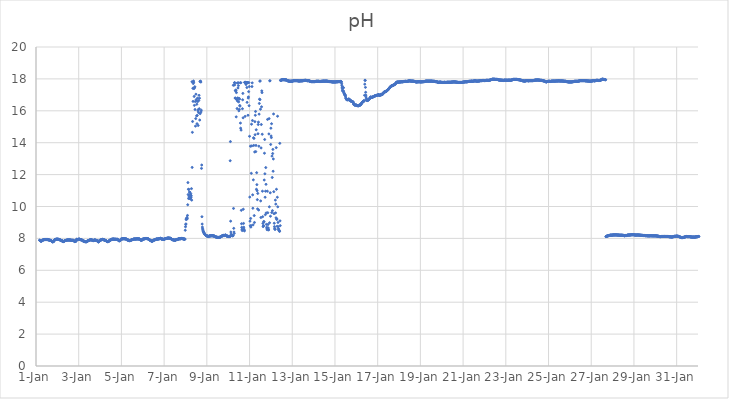
| Category | pH |
|---|---|
| 44562.166666666664 | 7.89 |
| 44562.177083333336 | 7.88 |
| 44562.1875 | 7.87 |
| 44562.197916666664 | 7.86 |
| 44562.208333333336 | 7.85 |
| 44562.21875 | 7.83 |
| 44562.229166666664 | 7.83 |
| 44562.239583333336 | 7.82 |
| 44562.25 | 7.83 |
| 44562.260416666664 | 7.84 |
| 44562.270833333336 | 7.84 |
| 44562.28125 | 7.86 |
| 44562.291666666664 | 7.87 |
| 44562.302083333336 | 7.88 |
| 44562.3125 | 7.89 |
| 44562.322916666664 | 7.9 |
| 44562.333333333336 | 7.91 |
| 44562.34375 | 7.91 |
| 44562.354166666664 | 7.91 |
| 44562.364583333336 | 7.91 |
| 44562.375 | 7.92 |
| 44562.385416666664 | 7.92 |
| 44562.395833333336 | 7.93 |
| 44562.40625 | 7.93 |
| 44562.416666666664 | 7.93 |
| 44562.427083333336 | 7.93 |
| 44562.4375 | 7.93 |
| 44562.447916666664 | 7.93 |
| 44562.458333333336 | 7.93 |
| 44562.46875 | 7.93 |
| 44562.479166666664 | 7.93 |
| 44562.489583333336 | 7.93 |
| 44562.5 | 7.93 |
| 44562.510416666664 | 7.93 |
| 44562.520833333336 | 7.93 |
| 44562.53125 | 7.93 |
| 44562.541666666664 | 7.92 |
| 44562.552083333336 | 7.93 |
| 44562.5625 | 7.92 |
| 44562.572916666664 | 7.92 |
| 44562.583333333336 | 7.91 |
| 44562.59375 | 7.91 |
| 44562.604166666664 | 7.9 |
| 44562.614583333336 | 7.9 |
| 44562.625 | 7.89 |
| 44562.635416666664 | 7.89 |
| 44562.645833333336 | 7.89 |
| 44562.65625 | 7.87 |
| 44562.666666666664 | 7.88 |
| 44562.677083333336 | 7.88 |
| 44562.6875 | 7.87 |
| 44562.697916666664 | 7.87 |
| 44562.708333333336 | 7.86 |
| 44562.71875 | 7.85 |
| 44562.729166666664 | 7.85 |
| 44562.739583333336 | 7.83 |
| 44562.75 | 7.81 |
| 44562.760416666664 | 7.79 |
| 44562.770833333336 | 7.79 |
| 44562.78125 | 7.78 |
| 44562.791666666664 | 7.79 |
| 44562.802083333336 | 7.8 |
| 44562.8125 | 7.8 |
| 44562.822916666664 | 7.8 |
| 44562.833333333336 | 7.82 |
| 44562.84375 | 7.84 |
| 44562.854166666664 | 7.87 |
| 44562.864583333336 | 7.9 |
| 44562.875 | 7.91 |
| 44562.885416666664 | 7.92 |
| 44562.895833333336 | 7.93 |
| 44562.90625 | 7.93 |
| 44562.916666666664 | 7.94 |
| 44562.927083333336 | 7.94 |
| 44562.9375 | 7.94 |
| 44562.947916666664 | 7.95 |
| 44562.958333333336 | 7.95 |
| 44562.96875 | 7.95 |
| 44562.979166666664 | 7.95 |
| 44562.989583333336 | 7.95 |
| 44563.0 | 7.95 |
| 44563.010416666664 | 7.95 |
| 44563.020833333336 | 7.95 |
| 44563.03125 | 7.95 |
| 44563.041666666664 | 7.94 |
| 44563.052083333336 | 7.94 |
| 44563.0625 | 7.94 |
| 44563.072916666664 | 7.93 |
| 44563.083333333336 | 7.93 |
| 44563.09375 | 7.93 |
| 44563.104166666664 | 7.92 |
| 44563.114583333336 | 7.91 |
| 44563.125 | 7.9 |
| 44563.135416666664 | 7.9 |
| 44563.145833333336 | 7.89 |
| 44563.15625 | 7.89 |
| 44563.166666666664 | 7.87 |
| 44563.177083333336 | 7.86 |
| 44563.1875 | 7.85 |
| 44563.197916666664 | 7.86 |
| 44563.208333333336 | 7.87 |
| 44563.21875 | 7.86 |
| 44563.229166666664 | 7.85 |
| 44563.239583333336 | 7.83 |
| 44563.25 | 7.82 |
| 44563.260416666664 | 7.8 |
| 44563.270833333336 | 7.8 |
| 44563.28125 | 7.8 |
| 44563.291666666664 | 7.81 |
| 44563.302083333336 | 7.81 |
| 44563.3125 | 7.82 |
| 44563.322916666664 | 7.83 |
| 44563.333333333336 | 7.84 |
| 44563.34375 | 7.86 |
| 44563.354166666664 | 7.86 |
| 44563.364583333336 | 7.87 |
| 44563.375 | 7.87 |
| 44563.385416666664 | 7.87 |
| 44563.395833333336 | 7.87 |
| 44563.40625 | 7.88 |
| 44563.416666666664 | 7.88 |
| 44563.427083333336 | 7.88 |
| 44563.4375 | 7.89 |
| 44563.447916666664 | 7.89 |
| 44563.458333333336 | 7.9 |
| 44563.46875 | 7.9 |
| 44563.479166666664 | 7.9 |
| 44563.489583333336 | 7.9 |
| 44563.5 | 7.9 |
| 44563.510416666664 | 7.9 |
| 44563.520833333336 | 7.9 |
| 44563.53125 | 7.9 |
| 44563.541666666664 | 7.9 |
| 44563.552083333336 | 7.9 |
| 44563.5625 | 7.91 |
| 44563.572916666664 | 7.9 |
| 44563.583333333336 | 7.89 |
| 44563.59375 | 7.9 |
| 44563.604166666664 | 7.9 |
| 44563.614583333336 | 7.89 |
| 44563.625 | 7.89 |
| 44563.635416666664 | 7.89 |
| 44563.645833333336 | 7.89 |
| 44563.65625 | 7.88 |
| 44563.666666666664 | 7.88 |
| 44563.677083333336 | 7.88 |
| 44563.6875 | 7.88 |
| 44563.697916666664 | 7.88 |
| 44563.708333333336 | 7.88 |
| 44563.71875 | 7.88 |
| 44563.729166666664 | 7.88 |
| 44563.739583333336 | 7.88 |
| 44563.75 | 7.88 |
| 44563.760416666664 | 7.87 |
| 44563.770833333336 | 7.86 |
| 44563.78125 | 7.84 |
| 44563.791666666664 | 7.83 |
| 44563.802083333336 | 7.81 |
| 44563.8125 | 7.8 |
| 44563.822916666664 | 7.8 |
| 44563.833333333336 | 7.81 |
| 44563.84375 | 7.81 |
| 44563.854166666664 | 7.81 |
| 44563.864583333336 | 7.82 |
| 44563.875 | 7.84 |
| 44563.885416666664 | 7.86 |
| 44563.895833333336 | 7.94 |
| 44563.90625 | 7.94 |
| 44563.916666666664 | 7.94 |
| 44563.927083333336 | 7.94 |
| 44563.9375 | 7.93 |
| 44563.947916666664 | 7.93 |
| 44563.958333333336 | 7.93 |
| 44563.96875 | 7.93 |
| 44563.979166666664 | 7.93 |
| 44563.989583333336 | 7.94 |
| 44564.0 | 7.94 |
| 44564.010416666664 | 7.96 |
| 44564.020833333336 | 7.97 |
| 44564.03125 | 7.94 |
| 44564.041666666664 | 7.94 |
| 44564.052083333336 | 7.94 |
| 44564.0625 | 7.94 |
| 44564.072916666664 | 7.92 |
| 44564.083333333336 | 7.92 |
| 44564.09375 | 7.92 |
| 44564.104166666664 | 7.92 |
| 44564.114583333336 | 7.92 |
| 44564.125 | 7.91 |
| 44564.135416666664 | 7.91 |
| 44564.145833333336 | 7.9 |
| 44564.15625 | 7.9 |
| 44564.166666666664 | 7.88 |
| 44564.177083333336 | 7.87 |
| 44564.1875 | 7.86 |
| 44564.197916666664 | 7.85 |
| 44564.208333333336 | 7.84 |
| 44564.21875 | 7.83 |
| 44564.229166666664 | 7.83 |
| 44564.239583333336 | 7.83 |
| 44564.25 | 7.83 |
| 44564.260416666664 | 7.82 |
| 44564.270833333336 | 7.81 |
| 44564.28125 | 7.8 |
| 44564.291666666664 | 7.79 |
| 44564.302083333336 | 7.79 |
| 44564.3125 | 7.79 |
| 44564.322916666664 | 7.8 |
| 44564.333333333336 | 7.79 |
| 44564.34375 | 7.79 |
| 44564.354166666664 | 7.79 |
| 44564.364583333336 | 7.79 |
| 44564.375 | 7.8 |
| 44564.385416666664 | 7.82 |
| 44564.395833333336 | 7.83 |
| 44564.40625 | 7.83 |
| 44564.416666666664 | 7.84 |
| 44564.427083333336 | 7.85 |
| 44564.4375 | 7.85 |
| 44564.447916666664 | 7.86 |
| 44564.458333333336 | 7.86 |
| 44564.46875 | 7.87 |
| 44564.479166666664 | 7.87 |
| 44564.489583333336 | 7.88 |
| 44564.5 | 7.89 |
| 44564.510416666664 | 7.89 |
| 44564.520833333336 | 7.9 |
| 44564.53125 | 7.91 |
| 44564.541666666664 | 7.91 |
| 44564.552083333336 | 7.91 |
| 44564.5625 | 7.91 |
| 44564.572916666664 | 7.92 |
| 44564.583333333336 | 7.91 |
| 44564.59375 | 7.9 |
| 44564.604166666664 | 7.9 |
| 44564.614583333336 | 7.9 |
| 44564.625 | 7.9 |
| 44564.635416666664 | 7.89 |
| 44564.645833333336 | 7.88 |
| 44564.65625 | 7.87 |
| 44564.666666666664 | 7.87 |
| 44564.677083333336 | 7.86 |
| 44564.6875 | 7.86 |
| 44564.697916666664 | 7.87 |
| 44564.708333333336 | 7.88 |
| 44564.71875 | 7.9 |
| 44564.729166666664 | 7.89 |
| 44564.739583333336 | 7.9 |
| 44564.75 | 7.9 |
| 44564.760416666664 | 7.89 |
| 44564.770833333336 | 7.89 |
| 44564.78125 | 7.89 |
| 44564.791666666664 | 7.89 |
| 44564.802083333336 | 7.88 |
| 44564.8125 | 7.88 |
| 44564.822916666664 | 7.87 |
| 44564.833333333336 | 7.87 |
| 44564.84375 | 7.87 |
| 44564.854166666664 | 7.86 |
| 44564.864583333336 | 7.85 |
| 44564.875 | 7.83 |
| 44564.885416666664 | 7.82 |
| 44564.895833333336 | 7.81 |
| 44564.90625 | 7.8 |
| 44564.916666666664 | 7.78 |
| 44564.927083333336 | 7.78 |
| 44564.9375 | 7.79 |
| 44564.947916666664 | 7.8 |
| 44564.958333333336 | 7.82 |
| 44564.96875 | 7.87 |
| 44564.979166666664 | 7.87 |
| 44564.989583333336 | 7.88 |
| 44565.0 | 7.88 |
| 44565.010416666664 | 7.89 |
| 44565.020833333336 | 7.9 |
| 44565.03125 | 7.9 |
| 44565.041666666664 | 7.9 |
| 44565.052083333336 | 7.91 |
| 44565.0625 | 7.92 |
| 44565.072916666664 | 7.92 |
| 44565.083333333336 | 7.92 |
| 44565.09375 | 7.93 |
| 44565.104166666664 | 7.93 |
| 44565.114583333336 | 7.94 |
| 44565.125 | 7.94 |
| 44565.135416666664 | 7.93 |
| 44565.145833333336 | 7.93 |
| 44565.15625 | 7.92 |
| 44565.166666666664 | 7.92 |
| 44565.177083333336 | 7.91 |
| 44565.1875 | 7.91 |
| 44565.197916666664 | 7.9 |
| 44565.208333333336 | 7.89 |
| 44565.21875 | 7.89 |
| 44565.229166666664 | 7.88 |
| 44565.239583333336 | 7.87 |
| 44565.25 | 7.88 |
| 44565.260416666664 | 7.87 |
| 44565.270833333336 | 7.87 |
| 44565.28125 | 7.86 |
| 44565.291666666664 | 7.84 |
| 44565.302083333336 | 7.83 |
| 44565.3125 | 7.82 |
| 44565.322916666664 | 7.82 |
| 44565.333333333336 | 7.81 |
| 44565.34375 | 7.8 |
| 44565.354166666664 | 7.8 |
| 44565.364583333336 | 7.79 |
| 44565.375 | 7.8 |
| 44565.385416666664 | 7.8 |
| 44565.395833333336 | 7.81 |
| 44565.40625 | 7.81 |
| 44565.416666666664 | 7.83 |
| 44565.427083333336 | 7.85 |
| 44565.4375 | 7.88 |
| 44565.447916666664 | 7.88 |
| 44565.458333333336 | 7.88 |
| 44565.46875 | 7.89 |
| 44565.479166666664 | 7.89 |
| 44565.489583333336 | 7.9 |
| 44565.5 | 7.9 |
| 44565.510416666664 | 7.91 |
| 44565.520833333336 | 7.92 |
| 44565.53125 | 7.93 |
| 44565.541666666664 | 7.94 |
| 44565.552083333336 | 7.95 |
| 44565.5625 | 7.95 |
| 44565.572916666664 | 7.95 |
| 44565.583333333336 | 7.95 |
| 44565.59375 | 7.95 |
| 44565.604166666664 | 7.95 |
| 44565.614583333336 | 7.96 |
| 44565.625 | 7.96 |
| 44565.635416666664 | 7.96 |
| 44565.645833333336 | 7.95 |
| 44565.65625 | 7.94 |
| 44565.666666666664 | 7.94 |
| 44565.677083333336 | 7.95 |
| 44565.6875 | 7.95 |
| 44565.697916666664 | 7.95 |
| 44565.708333333336 | 7.95 |
| 44565.71875 | 7.95 |
| 44565.729166666664 | 7.94 |
| 44565.739583333336 | 7.94 |
| 44565.75 | 7.94 |
| 44565.760416666664 | 7.94 |
| 44565.770833333336 | 7.94 |
| 44565.78125 | 7.94 |
| 44565.791666666664 | 7.94 |
| 44565.802083333336 | 7.95 |
| 44565.8125 | 7.94 |
| 44565.822916666664 | 7.93 |
| 44565.833333333336 | 7.92 |
| 44565.84375 | 7.9 |
| 44565.854166666664 | 7.89 |
| 44565.864583333336 | 7.88 |
| 44565.875 | 7.86 |
| 44565.885416666664 | 7.85 |
| 44565.895833333336 | 7.85 |
| 44565.90625 | 7.85 |
| 44565.916666666664 | 7.86 |
| 44565.927083333336 | 7.86 |
| 44565.9375 | 7.86 |
| 44565.947916666664 | 7.87 |
| 44565.958333333336 | 7.89 |
| 44565.96875 | 7.94 |
| 44565.979166666664 | 7.95 |
| 44565.989583333336 | 7.95 |
| 44566.0 | 7.96 |
| 44566.010416666664 | 7.96 |
| 44566.020833333336 | 7.96 |
| 44566.03125 | 7.97 |
| 44566.041666666664 | 7.97 |
| 44566.052083333336 | 7.97 |
| 44566.0625 | 7.98 |
| 44566.072916666664 | 7.98 |
| 44566.083333333336 | 7.98 |
| 44566.09375 | 7.98 |
| 44566.104166666664 | 7.98 |
| 44566.114583333336 | 7.98 |
| 44566.125 | 7.98 |
| 44566.135416666664 | 7.98 |
| 44566.145833333336 | 7.98 |
| 44566.15625 | 7.98 |
| 44566.166666666664 | 7.97 |
| 44566.177083333336 | 7.97 |
| 44566.1875 | 7.97 |
| 44566.197916666664 | 7.97 |
| 44566.208333333336 | 7.96 |
| 44566.21875 | 7.96 |
| 44566.229166666664 | 7.96 |
| 44566.239583333336 | 7.95 |
| 44566.25 | 7.94 |
| 44566.260416666664 | 7.92 |
| 44566.270833333336 | 7.91 |
| 44566.28125 | 7.89 |
| 44566.291666666664 | 7.9 |
| 44566.302083333336 | 7.9 |
| 44566.3125 | 7.9 |
| 44566.322916666664 | 7.89 |
| 44566.333333333336 | 7.89 |
| 44566.34375 | 7.87 |
| 44566.354166666664 | 7.86 |
| 44566.364583333336 | 7.86 |
| 44566.375 | 7.86 |
| 44566.385416666664 | 7.86 |
| 44566.395833333336 | 7.86 |
| 44566.40625 | 7.86 |
| 44566.416666666664 | 7.87 |
| 44566.427083333336 | 7.87 |
| 44566.4375 | 7.88 |
| 44566.447916666664 | 7.89 |
| 44566.458333333336 | 7.9 |
| 44566.46875 | 7.91 |
| 44566.479166666664 | 7.91 |
| 44566.489583333336 | 7.92 |
| 44566.5 | 7.92 |
| 44566.510416666664 | 7.92 |
| 44566.520833333336 | 7.93 |
| 44566.53125 | 7.93 |
| 44566.541666666664 | 7.94 |
| 44566.552083333336 | 7.94 |
| 44566.5625 | 7.95 |
| 44566.572916666664 | 7.95 |
| 44566.583333333336 | 7.96 |
| 44566.59375 | 7.96 |
| 44566.604166666664 | 7.96 |
| 44566.614583333336 | 7.96 |
| 44566.625 | 7.96 |
| 44566.635416666664 | 7.96 |
| 44566.645833333336 | 7.96 |
| 44566.65625 | 7.96 |
| 44566.666666666664 | 7.96 |
| 44566.677083333336 | 7.96 |
| 44566.6875 | 7.96 |
| 44566.697916666664 | 7.97 |
| 44566.708333333336 | 7.97 |
| 44566.71875 | 7.97 |
| 44566.729166666664 | 7.97 |
| 44566.739583333336 | 7.97 |
| 44566.75 | 7.97 |
| 44566.760416666664 | 7.97 |
| 44566.770833333336 | 7.97 |
| 44566.78125 | 7.97 |
| 44566.791666666664 | 7.96 |
| 44566.802083333336 | 7.96 |
| 44566.8125 | 7.97 |
| 44566.822916666664 | 7.97 |
| 44566.833333333336 | 7.97 |
| 44566.84375 | 7.96 |
| 44566.854166666664 | 7.95 |
| 44566.864583333336 | 7.93 |
| 44566.875 | 7.93 |
| 44566.885416666664 | 7.91 |
| 44566.895833333336 | 7.91 |
| 44566.90625 | 7.89 |
| 44566.916666666664 | 7.89 |
| 44566.927083333336 | 7.89 |
| 44566.9375 | 7.89 |
| 44566.947916666664 | 7.89 |
| 44566.958333333336 | 7.89 |
| 44566.96875 | 7.9 |
| 44566.979166666664 | 7.92 |
| 44566.989583333336 | 7.94 |
| 44567.0 | 7.95 |
| 44567.010416666664 | 7.96 |
| 44567.020833333336 | 7.96 |
| 44567.03125 | 7.96 |
| 44567.041666666664 | 7.97 |
| 44567.052083333336 | 7.97 |
| 44567.0625 | 7.97 |
| 44567.072916666664 | 7.97 |
| 44567.083333333336 | 7.98 |
| 44567.09375 | 7.98 |
| 44567.104166666664 | 7.99 |
| 44567.114583333336 | 7.99 |
| 44567.125 | 7.99 |
| 44567.135416666664 | 7.99 |
| 44567.145833333336 | 7.99 |
| 44567.15625 | 7.99 |
| 44567.166666666664 | 7.99 |
| 44567.177083333336 | 7.99 |
| 44567.1875 | 7.99 |
| 44567.197916666664 | 7.99 |
| 44567.208333333336 | 7.98 |
| 44567.21875 | 7.98 |
| 44567.229166666664 | 7.98 |
| 44567.239583333336 | 7.98 |
| 44567.25 | 7.97 |
| 44567.260416666664 | 7.97 |
| 44567.270833333336 | 7.95 |
| 44567.28125 | 7.94 |
| 44567.291666666664 | 7.93 |
| 44567.302083333336 | 7.92 |
| 44567.3125 | 7.91 |
| 44567.322916666664 | 7.9 |
| 44567.333333333336 | 7.9 |
| 44567.34375 | 7.89 |
| 44567.354166666664 | 7.88 |
| 44567.364583333336 | 7.87 |
| 44567.375 | 7.86 |
| 44567.385416666664 | 7.85 |
| 44567.395833333336 | 7.84 |
| 44567.40625 | 7.83 |
| 44567.416666666664 | 7.83 |
| 44567.427083333336 | 7.82 |
| 44567.4375 | 7.83 |
| 44567.447916666664 | 7.83 |
| 44567.458333333336 | 7.83 |
| 44567.46875 | 7.84 |
| 44567.479166666664 | 7.85 |
| 44567.489583333336 | 7.87 |
| 44567.5 | 7.88 |
| 44567.510416666664 | 7.89 |
| 44567.520833333336 | 7.89 |
| 44567.53125 | 7.9 |
| 44567.541666666664 | 7.9 |
| 44567.552083333336 | 7.91 |
| 44567.5625 | 7.91 |
| 44567.572916666664 | 7.91 |
| 44567.583333333336 | 7.92 |
| 44567.59375 | 7.93 |
| 44567.604166666664 | 7.94 |
| 44567.614583333336 | 7.94 |
| 44567.625 | 7.95 |
| 44567.635416666664 | 7.96 |
| 44567.645833333336 | 7.96 |
| 44567.65625 | 7.96 |
| 44567.666666666664 | 7.96 |
| 44567.677083333336 | 7.95 |
| 44567.6875 | 7.96 |
| 44567.697916666664 | 7.96 |
| 44567.708333333336 | 7.95 |
| 44567.71875 | 7.96 |
| 44567.729166666664 | 7.97 |
| 44567.739583333336 | 7.97 |
| 44567.75 | 7.98 |
| 44567.760416666664 | 7.98 |
| 44567.770833333336 | 7.98 |
| 44567.78125 | 7.98 |
| 44567.791666666664 | 7.98 |
| 44567.802083333336 | 7.99 |
| 44567.8125 | 7.99 |
| 44567.822916666664 | 8 |
| 44567.833333333336 | 8.01 |
| 44567.84375 | 8 |
| 44567.854166666664 | 7.98 |
| 44567.864583333336 | 7.96 |
| 44567.875 | 7.96 |
| 44567.885416666664 | 7.96 |
| 44567.895833333336 | 7.96 |
| 44567.90625 | 7.96 |
| 44567.916666666664 | 7.96 |
| 44567.927083333336 | 7.96 |
| 44567.9375 | 7.95 |
| 44567.947916666664 | 7.95 |
| 44567.958333333336 | 7.94 |
| 44567.96875 | 7.94 |
| 44567.979166666664 | 7.94 |
| 44567.989583333336 | 7.94 |
| 44568.0 | 7.93 |
| 44568.010416666664 | 7.94 |
| 44568.020833333336 | 7.95 |
| 44568.03125 | 7.96 |
| 44568.041666666664 | 7.98 |
| 44568.052083333336 | 7.99 |
| 44568.0625 | 7.99 |
| 44568.072916666664 | 7.99 |
| 44568.083333333336 | 7.99 |
| 44568.09375 | 7.99 |
| 44568.104166666664 | 8 |
| 44568.114583333336 | 8 |
| 44568.125 | 8 |
| 44568.135416666664 | 8.01 |
| 44568.145833333336 | 8.01 |
| 44568.15625 | 8.01 |
| 44568.166666666664 | 8.02 |
| 44568.177083333336 | 8.02 |
| 44568.1875 | 8.02 |
| 44568.197916666664 | 8.02 |
| 44568.208333333336 | 8.02 |
| 44568.21875 | 8.02 |
| 44568.229166666664 | 8.02 |
| 44568.239583333336 | 8.01 |
| 44568.25 | 8.01 |
| 44568.260416666664 | 8.01 |
| 44568.270833333336 | 8.01 |
| 44568.28125 | 8.01 |
| 44568.291666666664 | 8.01 |
| 44568.302083333336 | 8 |
| 44568.3125 | 7.99 |
| 44568.322916666664 | 7.98 |
| 44568.333333333336 | 7.97 |
| 44568.34375 | 7.95 |
| 44568.354166666664 | 7.93 |
| 44568.364583333336 | 7.94 |
| 44568.375 | 7.93 |
| 44568.385416666664 | 7.92 |
| 44568.395833333336 | 7.92 |
| 44568.40625 | 7.92 |
| 44568.416666666664 | 7.91 |
| 44568.427083333336 | 7.9 |
| 44568.4375 | 7.9 |
| 44568.447916666664 | 7.9 |
| 44568.458333333336 | 7.9 |
| 44568.46875 | 7.9 |
| 44568.479166666664 | 7.89 |
| 44568.489583333336 | 7.89 |
| 44568.5 | 7.89 |
| 44568.510416666664 | 7.89 |
| 44568.520833333336 | 7.89 |
| 44568.53125 | 7.89 |
| 44568.541666666664 | 7.9 |
| 44568.552083333336 | 7.9 |
| 44568.5625 | 7.92 |
| 44568.572916666664 | 7.93 |
| 44568.583333333336 | 7.93 |
| 44568.59375 | 7.93 |
| 44568.604166666664 | 7.93 |
| 44568.614583333336 | 7.93 |
| 44568.625 | 7.93 |
| 44568.635416666664 | 7.94 |
| 44568.645833333336 | 7.95 |
| 44568.65625 | 7.96 |
| 44568.666666666664 | 7.96 |
| 44568.677083333336 | 7.97 |
| 44568.6875 | 7.97 |
| 44568.697916666664 | 7.98 |
| 44568.708333333336 | 7.98 |
| 44568.71875 | 7.98 |
| 44568.729166666664 | 7.97 |
| 44568.739583333336 | 7.97 |
| 44568.75 | 7.98 |
| 44568.760416666664 | 7.98 |
| 44568.770833333336 | 7.98 |
| 44568.78125 | 7.99 |
| 44568.791666666664 | 7.99 |
| 44568.802083333336 | 7.99 |
| 44568.8125 | 7.99 |
| 44568.822916666664 | 8 |
| 44568.833333333336 | 8 |
| 44568.84375 | 7.99 |
| 44568.854166666664 | 7.99 |
| 44568.864583333336 | 7.98 |
| 44568.875 | 7.99 |
| 44568.885416666664 | 7.97 |
| 44568.895833333336 | 7.97 |
| 44568.90625 | 7.97 |
| 44568.916666666664 | 7.96 |
| 44568.927083333336 | 7.96 |
| 44568.9375 | 7.96 |
| 44568.947916666664 | 7.95 |
| 44568.958333333336 | 7.95 |
| 44568.96875 | 7.95 |
| 44568.979166666664 | 7.96 |
| 44568.989583333336 | 8.51 |
| 44569.0 | 8.73 |
| 44569.010416666664 | 8.87 |
| 44569.020833333336 | 8.91 |
| 44569.03125 | 9.18 |
| 44569.041666666664 | 9.24 |
| 44569.052083333336 | 9.22 |
| 44569.0625 | 9.27 |
| 44569.072916666664 | 9.31 |
| 44569.083333333336 | 9.23 |
| 44569.09375 | 9.44 |
| 44569.104166666664 | 10.11 |
| 44569.114583333336 | 11.5 |
| 44569.125 | 10.75 |
| 44569.135416666664 | 11.08 |
| 44569.145833333336 | 10.5 |
| 44569.15625 | 11.07 |
| 44569.166666666664 | 10.65 |
| 44569.177083333336 | 10.55 |
| 44569.1875 | 10.91 |
| 44569.197916666664 | 10.51 |
| 44569.208333333336 | 10.89 |
| 44569.21875 | 10.48 |
| 44569.229166666664 | 10.73 |
| 44569.239583333336 | 10.53 |
| 44569.25 | 10.8 |
| 44569.260416666664 | 10.57 |
| 44569.270833333336 | 10.67 |
| 44569.28125 | 11.12 |
| 44569.291666666664 | 10.4 |
| 44569.302083333336 | 17.82 |
| 44569.3125 | 12.45 |
| 44569.322916666664 | 14.65 |
| 44569.333333333336 | 15.33 |
| 44569.34375 | 17.41 |
| 44569.354166666664 | 16.59 |
| 44569.364583333336 | 17.71 |
| 44569.375 | 17.87 |
| 44569.385416666664 | 17.79 |
| 44569.395833333336 | 17.39 |
| 44569.40625 | 16.9 |
| 44569.416666666664 | 16.34 |
| 44569.427083333336 | 17.45 |
| 44569.4375 | 17.51 |
| 44569.447916666664 | 16.08 |
| 44569.458333333336 | 16.58 |
| 44569.46875 | 15.04 |
| 44569.479166666664 | 15.51 |
| 44569.489583333336 | 17.04 |
| 44569.5 | 16.7 |
| 44569.510416666664 | 16.62 |
| 44569.520833333336 | 15.68 |
| 44569.53125 | 16.41 |
| 44569.541666666664 | 15.19 |
| 44569.552083333336 | 15.71 |
| 44569.5625 | 16.79 |
| 44569.572916666664 | 16.58 |
| 44569.583333333336 | 16 |
| 44569.59375 | 15.08 |
| 44569.604166666664 | 16.08 |
| 44569.614583333336 | 15.89 |
| 44569.625 | 16.65 |
| 44569.635416666664 | 16.97 |
| 44569.645833333336 | 16.13 |
| 44569.65625 | 16.79 |
| 44569.666666666664 | 15.42 |
| 44569.677083333336 | 17.84 |
| 44569.6875 | 15.82 |
| 44569.697916666664 | 17.85 |
| 44569.708333333336 | 17.85 |
| 44569.71875 | 17.8 |
| 44569.729166666664 | 15.93 |
| 44569.739583333336 | 16.04 |
| 44569.75 | 12.39 |
| 44569.760416666664 | 12.6 |
| 44569.770833333336 | 9.36 |
| 44569.78125 | 8.9 |
| 44569.791666666664 | 8.71 |
| 44569.802083333336 | 8.61 |
| 44569.8125 | 8.54 |
| 44569.822916666664 | 8.48 |
| 44569.833333333336 | 8.44 |
| 44569.84375 | 8.41 |
| 44569.854166666664 | 8.38 |
| 44569.864583333336 | 8.35 |
| 44569.875 | 8.32 |
| 44569.885416666664 | 8.3 |
| 44569.895833333336 | 8.28 |
| 44569.90625 | 8.26 |
| 44569.916666666664 | 8.24 |
| 44569.927083333336 | 8.23 |
| 44569.9375 | 8.21 |
| 44569.947916666664 | 8.2 |
| 44569.958333333336 | 8.19 |
| 44569.96875 | 8.18 |
| 44569.979166666664 | 8.17 |
| 44569.989583333336 | 8.16 |
| 44570.0 | 8.16 |
| 44570.010416666664 | 8.15 |
| 44570.020833333336 | 8.15 |
| 44570.03125 | 8.14 |
| 44570.041666666664 | 8.14 |
| 44570.052083333336 | 8.13 |
| 44570.0625 | 8.13 |
| 44570.072916666664 | 8.12 |
| 44570.083333333336 | 8.12 |
| 44570.09375 | 8.13 |
| 44570.104166666664 | 8.14 |
| 44570.114583333336 | 8.15 |
| 44570.125 | 8.16 |
| 44570.135416666664 | 8.16 |
| 44570.145833333336 | 8.16 |
| 44570.15625 | 8.16 |
| 44570.166666666664 | 8.16 |
| 44570.177083333336 | 8.16 |
| 44570.1875 | 8.16 |
| 44570.197916666664 | 8.16 |
| 44570.208333333336 | 8.17 |
| 44570.21875 | 8.17 |
| 44570.229166666664 | 8.17 |
| 44570.239583333336 | 8.17 |
| 44570.25 | 8.17 |
| 44570.260416666664 | 8.17 |
| 44570.270833333336 | 8.17 |
| 44570.28125 | 8.16 |
| 44570.291666666664 | 8.16 |
| 44570.302083333336 | 8.16 |
| 44570.3125 | 8.15 |
| 44570.322916666664 | 8.15 |
| 44570.333333333336 | 8.15 |
| 44570.34375 | 8.15 |
| 44570.354166666664 | 8.14 |
| 44570.364583333336 | 8.13 |
| 44570.375 | 8.12 |
| 44570.385416666664 | 8.11 |
| 44570.395833333336 | 8.11 |
| 44570.40625 | 8.1 |
| 44570.416666666664 | 8.1 |
| 44570.427083333336 | 8.09 |
| 44570.4375 | 8.08 |
| 44570.447916666664 | 8.08 |
| 44570.458333333336 | 8.08 |
| 44570.46875 | 8.07 |
| 44570.479166666664 | 8.07 |
| 44570.489583333336 | 8.07 |
| 44570.5 | 8.06 |
| 44570.510416666664 | 8.06 |
| 44570.520833333336 | 8.06 |
| 44570.53125 | 8.06 |
| 44570.541666666664 | 8.06 |
| 44570.552083333336 | 8.06 |
| 44570.5625 | 8.06 |
| 44570.572916666664 | 8.06 |
| 44570.583333333336 | 8.06 |
| 44570.59375 | 8.06 |
| 44570.604166666664 | 8.07 |
| 44570.614583333336 | 8.08 |
| 44570.625 | 8.09 |
| 44570.635416666664 | 8.09 |
| 44570.645833333336 | 8.1 |
| 44570.65625 | 8.11 |
| 44570.666666666664 | 8.12 |
| 44570.677083333336 | 8.12 |
| 44570.6875 | 8.13 |
| 44570.697916666664 | 8.14 |
| 44570.708333333336 | 8.15 |
| 44570.71875 | 8.16 |
| 44570.729166666664 | 8.16 |
| 44570.739583333336 | 8.17 |
| 44570.75 | 8.18 |
| 44570.760416666664 | 8.18 |
| 44570.770833333336 | 8.18 |
| 44570.78125 | 8.19 |
| 44570.791666666664 | 8.18 |
| 44570.802083333336 | 8.18 |
| 44570.8125 | 8.18 |
| 44570.822916666664 | 8.18 |
| 44570.833333333336 | 8.18 |
| 44570.84375 | 8.19 |
| 44570.854166666664 | 8.2 |
| 44570.864583333336 | 8.21 |
| 44570.875 | 8.2 |
| 44570.885416666664 | 8.2 |
| 44570.895833333336 | 8.2 |
| 44570.90625 | 8.17 |
| 44570.916666666664 | 8.16 |
| 44570.927083333336 | 8.15 |
| 44570.9375 | 8.15 |
| 44570.947916666664 | 8.15 |
| 44570.958333333336 | 8.14 |
| 44570.96875 | 8.14 |
| 44570.979166666664 | 8.13 |
| 44570.989583333336 | 8.13 |
| 44571.0 | 8.12 |
| 44571.010416666664 | 8.12 |
| 44571.020833333336 | 8.12 |
| 44571.03125 | 8.12 |
| 44571.041666666664 | 8.12 |
| 44571.052083333336 | 8.12 |
| 44571.0625 | 8.12 |
| 44571.072916666664 | 8.12 |
| 44571.083333333336 | 8.11 |
| 44571.09375 | 12.87 |
| 44571.104166666664 | 14.07 |
| 44571.114583333336 | 9.08 |
| 44571.125 | 8.4 |
| 44571.135416666664 | 8.27 |
| 44571.145833333336 | 8.22 |
| 44571.15625 | 8.21 |
| 44571.166666666664 | 8.19 |
| 44571.177083333336 | 8.18 |
| 44571.1875 | 8.18 |
| 44571.197916666664 | 8.17 |
| 44571.208333333336 | 8.17 |
| 44571.21875 | 8.17 |
| 44571.229166666664 | 8.17 |
| 44571.239583333336 | 17.6 |
| 44571.25 | 9.88 |
| 44571.260416666664 | 8.63 |
| 44571.270833333336 | 8.4 |
| 44571.28125 | 8.31 |
| 44571.291666666664 | 17.76 |
| 44571.302083333336 | 17.62 |
| 44571.3125 | 17.76 |
| 44571.322916666664 | 16.8 |
| 44571.333333333336 | 17.26 |
| 44571.34375 | 16.79 |
| 44571.354166666664 | 17.3 |
| 44571.364583333336 | 17.26 |
| 44571.375 | 15.62 |
| 44571.385416666664 | 17.14 |
| 44571.395833333336 | 16.7 |
| 44571.40625 | 16.72 |
| 44571.416666666664 | 16.14 |
| 44571.427083333336 | 17.74 |
| 44571.4375 | 16.61 |
| 44571.447916666664 | 16.81 |
| 44571.458333333336 | 17.43 |
| 44571.46875 | 17.76 |
| 44571.479166666664 | 17.58 |
| 44571.489583333336 | 16.56 |
| 44571.5 | 16 |
| 44571.510416666664 | 16.78 |
| 44571.520833333336 | 16.09 |
| 44571.53125 | 16.73 |
| 44571.541666666664 | 16.33 |
| 44571.552083333336 | 16.29 |
| 44571.5625 | 17.76 |
| 44571.572916666664 | 15.23 |
| 44571.583333333336 | 14.91 |
| 44571.59375 | 17.76 |
| 44571.604166666664 | 14.79 |
| 44571.614583333336 | 9.76 |
| 44571.625 | 8.92 |
| 44571.635416666664 | 8.69 |
| 44571.645833333336 | 8.57 |
| 44571.65625 | 8.49 |
| 44571.666666666664 | 16.13 |
| 44571.677083333336 | 16.69 |
| 44571.6875 | 17.09 |
| 44571.697916666664 | 15.56 |
| 44571.708333333336 | 9.83 |
| 44571.71875 | 8.94 |
| 44571.729166666664 | 8.7 |
| 44571.739583333336 | 8.58 |
| 44571.75 | 8.52 |
| 44571.760416666664 | 8.47 |
| 44571.770833333336 | 17.78 |
| 44571.78125 | 17.78 |
| 44571.791666666664 | 15.65 |
| 44571.802083333336 | 17.78 |
| 44571.8125 | 17.78 |
| 44571.822916666664 | 17.78 |
| 44571.833333333336 | 17.65 |
| 44571.84375 | 17.77 |
| 44571.854166666664 | 17.77 |
| 44571.864583333336 | 17.77 |
| 44571.875 | 17.46 |
| 44571.885416666664 | 16.53 |
| 44571.895833333336 | 17.77 |
| 44571.90625 | 17.77 |
| 44571.916666666664 | 17.77 |
| 44571.927083333336 | 15.72 |
| 44571.9375 | 16.8 |
| 44571.947916666664 | 16.87 |
| 44571.958333333336 | 17.2 |
| 44571.96875 | 17.77 |
| 44571.979166666664 | 16.32 |
| 44571.989583333336 | 17.52 |
| 44572.0 | 14.4 |
| 44572.010416666664 | 10.59 |
| 44572.020833333336 | 9.08 |
| 44572.03125 | 8.79 |
| 44572.041666666664 | 13.78 |
| 44572.052083333336 | 9.25 |
| 44572.0625 | 8.71 |
| 44572.072916666664 | 8.8 |
| 44572.083333333336 | 12.08 |
| 44572.09375 | 15.16 |
| 44572.104166666664 | 13.8 |
| 44572.114583333336 | 17.52 |
| 44572.125 | 17.75 |
| 44572.135416666664 | 15.39 |
| 44572.145833333336 | 10.73 |
| 44572.15625 | 9.89 |
| 44572.166666666664 | 8.85 |
| 44572.177083333336 | 11.67 |
| 44572.1875 | 14.31 |
| 44572.197916666664 | 13.83 |
| 44572.208333333336 | 14.27 |
| 44572.21875 | 9.43 |
| 44572.229166666664 | 9 |
| 44572.239583333336 | 13.42 |
| 44572.25 | 15.32 |
| 44572.260416666664 | 14.5 |
| 44572.270833333336 | 15.72 |
| 44572.28125 | 15.96 |
| 44572.291666666664 | 13.44 |
| 44572.302083333336 | 13.83 |
| 44572.3125 | 14.81 |
| 44572.322916666664 | 11.08 |
| 44572.333333333336 | 12.12 |
| 44572.34375 | 11.37 |
| 44572.354166666664 | 10.99 |
| 44572.364583333336 | 10.43 |
| 44572.375 | 9.85 |
| 44572.385416666664 | 10.82 |
| 44572.395833333336 | 14.56 |
| 44572.40625 | 15.14 |
| 44572.416666666664 | 15.29 |
| 44572.427083333336 | 9.78 |
| 44572.4375 | 13.78 |
| 44572.447916666664 | 15.79 |
| 44572.458333333336 | 16.46 |
| 44572.46875 | 16.73 |
| 44572.479166666664 | 17.86 |
| 44572.489583333336 | 16.7 |
| 44572.5 | 17.87 |
| 44572.510416666664 | 16.1 |
| 44572.520833333336 | 10.35 |
| 44572.53125 | 9.31 |
| 44572.541666666664 | 13.67 |
| 44572.552083333336 | 15.14 |
| 44572.5625 | 16.25 |
| 44572.572916666664 | 17.25 |
| 44572.583333333336 | 17.14 |
| 44572.59375 | 14.53 |
| 44572.604166666664 | 10.96 |
| 44572.614583333336 | 9.36 |
| 44572.625 | 8.94 |
| 44572.635416666664 | 8.74 |
| 44572.645833333336 | 8.78 |
| 44572.65625 | 8.8 |
| 44572.666666666664 | 9.06 |
| 44572.677083333336 | 9.04 |
| 44572.6875 | 11.66 |
| 44572.697916666664 | 13.34 |
| 44572.708333333336 | 14.2 |
| 44572.71875 | 12.05 |
| 44572.729166666664 | 10.58 |
| 44572.739583333336 | 9.49 |
| 44572.75 | 10.96 |
| 44572.760416666664 | 12.44 |
| 44572.770833333336 | 11.39 |
| 44572.78125 | 9.6 |
| 44572.791666666664 | 8.88 |
| 44572.802083333336 | 8.7 |
| 44572.8125 | 8.61 |
| 44572.822916666664 | 8.54 |
| 44572.833333333336 | 10.96 |
| 44572.84375 | 15.46 |
| 44572.854166666664 | 9.61 |
| 44572.864583333336 | 8.87 |
| 44572.875 | 8.66 |
| 44572.885416666664 | 8.57 |
| 44572.895833333336 | 8.53 |
| 44572.90625 | 14.55 |
| 44572.916666666664 | 15.51 |
| 44572.927083333336 | 9.98 |
| 44572.9375 | 8.98 |
| 44572.947916666664 | 17.88 |
| 44572.958333333336 | 17.88 |
| 44572.96875 | 10.86 |
| 44572.979166666664 | 9.39 |
| 44572.989583333336 | 13.89 |
| 44573.0 | 14.91 |
| 44573.010416666664 | 14.42 |
| 44573.020833333336 | 14.32 |
| 44573.03125 | 15.19 |
| 44573.041666666664 | 9.62 |
| 44573.052083333336 | 13.16 |
| 44573.0625 | 11.82 |
| 44573.072916666664 | 9.74 |
| 44573.083333333336 | 13.32 |
| 44573.09375 | 13.58 |
| 44573.104166666664 | 12.21 |
| 44573.114583333336 | 12.98 |
| 44573.125 | 15.8 |
| 44573.135416666664 | 10.93 |
| 44573.145833333336 | 9.55 |
| 44573.15625 | 8.95 |
| 44573.166666666664 | 8.74 |
| 44573.177083333336 | 8.63 |
| 44573.1875 | 8.57 |
| 44573.197916666664 | 8.57 |
| 44573.208333333336 | 10.4 |
| 44573.21875 | 9.6 |
| 44573.229166666664 | 10.15 |
| 44573.239583333336 | 9.29 |
| 44573.25 | 13.69 |
| 44573.260416666664 | 11.08 |
| 44573.270833333336 | 9.19 |
| 44573.28125 | 9.22 |
| 44573.291666666664 | 8.76 |
| 44573.302083333336 | 10.58 |
| 44573.3125 | 15.66 |
| 44573.322916666664 | 9.98 |
| 44573.333333333336 | 9 |
| 44573.34375 | 8.73 |
| 44573.354166666664 | 8.61 |
| 44573.364583333336 | 8.55 |
| 44573.375 | 8.51 |
| 44573.385416666664 | 8.48 |
| 44573.395833333336 | 8.46 |
| 44573.40625 | 8.44 |
| 44573.416666666664 | 13.96 |
| 44573.427083333336 | 9.1 |
| 44573.4375 | 8.8 |
| 44573.447916666664 | 17.9 |
| 44573.458333333336 | 17.91 |
| 44573.46875 | 17.93 |
| 44573.479166666664 | 17.92 |
| 44573.489583333336 | 17.92 |
| 44573.5 | 17.93 |
| 44573.510416666664 | 17.93 |
| 44573.520833333336 | 17.95 |
| 44573.53125 | 17.95 |
| 44573.541666666664 | 17.95 |
| 44573.552083333336 | 17.95 |
| 44573.5625 | 17.96 |
| 44573.572916666664 | 17.96 |
| 44573.583333333336 | 17.95 |
| 44573.59375 | 17.95 |
| 44573.604166666664 | 17.95 |
| 44573.614583333336 | 17.95 |
| 44573.625 | 17.95 |
| 44573.635416666664 | 17.95 |
| 44573.645833333336 | 17.95 |
| 44573.65625 | 17.94 |
| 44573.666666666664 | 17.94 |
| 44573.677083333336 | 17.94 |
| 44573.6875 | 17.94 |
| 44573.697916666664 | 17.94 |
| 44573.708333333336 | 17.94 |
| 44573.71875 | 17.93 |
| 44573.729166666664 | 17.93 |
| 44573.739583333336 | 17.92 |
| 44573.75 | 17.91 |
| 44573.760416666664 | 17.9 |
| 44573.770833333336 | 17.89 |
| 44573.78125 | 17.89 |
| 44573.791666666664 | 17.88 |
| 44573.802083333336 | 17.88 |
| 44573.8125 | 17.87 |
| 44573.822916666664 | 17.87 |
| 44573.833333333336 | 17.87 |
| 44573.84375 | 17.86 |
| 44573.854166666664 | 17.86 |
| 44573.864583333336 | 17.86 |
| 44573.875 | 17.85 |
| 44573.885416666664 | 17.85 |
| 44573.895833333336 | 17.85 |
| 44573.90625 | 17.85 |
| 44573.916666666664 | 17.85 |
| 44573.927083333336 | 17.85 |
| 44573.9375 | 17.86 |
| 44573.947916666664 | 17.86 |
| 44573.958333333336 | 17.86 |
| 44573.96875 | 17.85 |
| 44573.979166666664 | 17.86 |
| 44573.989583333336 | 17.85 |
| 44574.0 | 17.85 |
| 44574.010416666664 | 17.85 |
| 44574.020833333336 | 17.86 |
| 44574.03125 | 17.87 |
| 44574.041666666664 | 17.88 |
| 44574.052083333336 | 17.89 |
| 44574.0625 | 17.89 |
| 44574.072916666664 | 17.89 |
| 44574.083333333336 | 17.89 |
| 44574.09375 | 17.89 |
| 44574.104166666664 | 17.89 |
| 44574.114583333336 | 17.89 |
| 44574.125 | 17.89 |
| 44574.135416666664 | 17.89 |
| 44574.145833333336 | 17.89 |
| 44574.15625 | 17.89 |
| 44574.166666666664 | 17.89 |
| 44574.177083333336 | 17.89 |
| 44574.1875 | 17.89 |
| 44574.197916666664 | 17.89 |
| 44574.208333333336 | 17.89 |
| 44574.21875 | 17.89 |
| 44574.229166666664 | 17.89 |
| 44574.239583333336 | 17.89 |
| 44574.25 | 17.88 |
| 44574.260416666664 | 17.88 |
| 44574.270833333336 | 17.88 |
| 44574.28125 | 17.88 |
| 44574.291666666664 | 17.87 |
| 44574.302083333336 | 17.87 |
| 44574.3125 | 17.87 |
| 44574.322916666664 | 17.87 |
| 44574.333333333336 | 17.87 |
| 44574.34375 | 17.87 |
| 44574.354166666664 | 17.87 |
| 44574.364583333336 | 17.87 |
| 44574.375 | 17.88 |
| 44574.385416666664 | 17.88 |
| 44574.395833333336 | 17.88 |
| 44574.40625 | 17.88 |
| 44574.416666666664 | 17.88 |
| 44574.427083333336 | 17.88 |
| 44574.4375 | 17.88 |
| 44574.447916666664 | 17.88 |
| 44574.458333333336 | 17.88 |
| 44574.46875 | 17.88 |
| 44574.479166666664 | 17.88 |
| 44574.489583333336 | 17.89 |
| 44574.5 | 17.89 |
| 44574.510416666664 | 17.89 |
| 44574.520833333336 | 17.89 |
| 44574.53125 | 17.9 |
| 44574.541666666664 | 17.9 |
| 44574.552083333336 | 17.9 |
| 44574.5625 | 17.9 |
| 44574.572916666664 | 17.9 |
| 44574.583333333336 | 17.91 |
| 44574.59375 | 17.91 |
| 44574.604166666664 | 17.91 |
| 44574.614583333336 | 17.91 |
| 44574.625 | 17.91 |
| 44574.635416666664 | 17.91 |
| 44574.645833333336 | 17.9 |
| 44574.65625 | 17.9 |
| 44574.666666666664 | 17.9 |
| 44574.677083333336 | 17.9 |
| 44574.6875 | 17.89 |
| 44574.697916666664 | 17.89 |
| 44574.708333333336 | 17.89 |
| 44574.71875 | 17.88 |
| 44574.729166666664 | 17.89 |
| 44574.739583333336 | 17.89 |
| 44574.75 | 17.89 |
| 44574.760416666664 | 17.89 |
| 44574.770833333336 | 17.89 |
| 44574.78125 | 17.88 |
| 44574.791666666664 | 17.88 |
| 44574.802083333336 | 17.87 |
| 44574.8125 | 17.86 |
| 44574.822916666664 | 17.86 |
| 44574.833333333336 | 17.85 |
| 44574.84375 | 17.85 |
| 44574.854166666664 | 17.84 |
| 44574.864583333336 | 17.84 |
| 44574.875 | 17.84 |
| 44574.885416666664 | 17.83 |
| 44574.895833333336 | 17.83 |
| 44574.90625 | 17.83 |
| 44574.916666666664 | 17.83 |
| 44574.927083333336 | 17.83 |
| 44574.9375 | 17.83 |
| 44574.947916666664 | 17.83 |
| 44574.958333333336 | 17.83 |
| 44574.96875 | 17.83 |
| 44574.979166666664 | 17.83 |
| 44574.989583333336 | 17.83 |
| 44575.0 | 17.83 |
| 44575.010416666664 | 17.83 |
| 44575.020833333336 | 17.83 |
| 44575.03125 | 17.83 |
| 44575.041666666664 | 17.83 |
| 44575.052083333336 | 17.83 |
| 44575.0625 | 17.83 |
| 44575.072916666664 | 17.83 |
| 44575.083333333336 | 17.84 |
| 44575.09375 | 17.84 |
| 44575.104166666664 | 17.84 |
| 44575.114583333336 | 17.84 |
| 44575.125 | 17.85 |
| 44575.135416666664 | 17.85 |
| 44575.145833333336 | 17.85 |
| 44575.15625 | 17.85 |
| 44575.166666666664 | 17.85 |
| 44575.177083333336 | 17.85 |
| 44575.1875 | 17.85 |
| 44575.197916666664 | 17.85 |
| 44575.208333333336 | 17.85 |
| 44575.21875 | 17.85 |
| 44575.229166666664 | 17.85 |
| 44575.239583333336 | 17.85 |
| 44575.25 | 17.85 |
| 44575.260416666664 | 17.84 |
| 44575.270833333336 | 17.84 |
| 44575.28125 | 17.84 |
| 44575.291666666664 | 17.84 |
| 44575.302083333336 | 17.84 |
| 44575.3125 | 17.84 |
| 44575.322916666664 | 17.84 |
| 44575.333333333336 | 17.84 |
| 44575.34375 | 17.84 |
| 44575.354166666664 | 17.84 |
| 44575.364583333336 | 17.85 |
| 44575.375 | 17.85 |
| 44575.385416666664 | 17.85 |
| 44575.395833333336 | 17.85 |
| 44575.40625 | 17.85 |
| 44575.416666666664 | 17.85 |
| 44575.427083333336 | 17.86 |
| 44575.4375 | 17.86 |
| 44575.447916666664 | 17.86 |
| 44575.458333333336 | 17.86 |
| 44575.46875 | 17.86 |
| 44575.479166666664 | 17.86 |
| 44575.489583333336 | 17.86 |
| 44575.5 | 17.85 |
| 44575.510416666664 | 17.86 |
| 44575.520833333336 | 17.86 |
| 44575.53125 | 17.86 |
| 44575.541666666664 | 17.86 |
| 44575.552083333336 | 17.86 |
| 44575.5625 | 17.86 |
| 44575.572916666664 | 17.86 |
| 44575.583333333336 | 17.86 |
| 44575.59375 | 17.86 |
| 44575.604166666664 | 17.86 |
| 44575.614583333336 | 17.86 |
| 44575.625 | 17.86 |
| 44575.635416666664 | 17.86 |
| 44575.645833333336 | 17.85 |
| 44575.65625 | 17.85 |
| 44575.666666666664 | 17.84 |
| 44575.677083333336 | 17.84 |
| 44575.6875 | 17.84 |
| 44575.697916666664 | 17.84 |
| 44575.708333333336 | 17.84 |
| 44575.71875 | 17.84 |
| 44575.729166666664 | 17.84 |
| 44575.739583333336 | 17.84 |
| 44575.75 | 17.83 |
| 44575.760416666664 | 17.83 |
| 44575.770833333336 | 17.83 |
| 44575.78125 | 17.83 |
| 44575.791666666664 | 17.83 |
| 44575.802083333336 | 17.83 |
| 44575.8125 | 17.83 |
| 44575.822916666664 | 17.83 |
| 44575.833333333336 | 17.82 |
| 44575.84375 | 17.82 |
| 44575.854166666664 | 17.82 |
| 44575.864583333336 | 17.81 |
| 44575.875 | 17.81 |
| 44575.885416666664 | 17.81 |
| 44575.895833333336 | 17.81 |
| 44575.90625 | 17.81 |
| 44575.916666666664 | 17.81 |
| 44575.927083333336 | 17.81 |
| 44575.9375 | 17.81 |
| 44575.947916666664 | 17.81 |
| 44575.958333333336 | 17.81 |
| 44575.96875 | 17.81 |
| 44575.979166666664 | 17.81 |
| 44575.989583333336 | 17.81 |
| 44576.0 | 17.81 |
| 44576.010416666664 | 17.81 |
| 44576.020833333336 | 17.81 |
| 44576.03125 | 17.81 |
| 44576.041666666664 | 17.81 |
| 44576.052083333336 | 17.82 |
| 44576.0625 | 17.82 |
| 44576.072916666664 | 17.82 |
| 44576.083333333336 | 17.82 |
| 44576.09375 | 17.82 |
| 44576.104166666664 | 17.82 |
| 44576.114583333336 | 17.82 |
| 44576.125 | 17.82 |
| 44576.135416666664 | 17.83 |
| 44576.145833333336 | 17.83 |
| 44576.15625 | 17.83 |
| 44576.166666666664 | 17.83 |
| 44576.177083333336 | 17.83 |
| 44576.1875 | 17.83 |
| 44576.197916666664 | 17.83 |
| 44576.208333333336 | 17.83 |
| 44576.21875 | 17.83 |
| 44576.229166666664 | 17.83 |
| 44576.239583333336 | 17.83 |
| 44576.25 | 17.84 |
| 44576.260416666664 | 17.84 |
| 44576.270833333336 | 17.83 |
| 44576.28125 | 17.83 |
| 44576.291666666664 | 17.83 |
| 44576.302083333336 | 17.8 |
| 44576.3125 | 17.7 |
| 44576.322916666664 | 17.59 |
| 44576.333333333336 | 17.48 |
| 44576.34375 | 17.39 |
| 44576.354166666664 | 17.29 |
| 44576.364583333336 | 17.24 |
| 44576.375 | 17.23 |
| 44576.385416666664 | 17.46 |
| 44576.395833333336 | 17.44 |
| 44576.40625 | 17.23 |
| 44576.416666666664 | 17.14 |
| 44576.427083333336 | 17.09 |
| 44576.4375 | 17.05 |
| 44576.447916666664 | 17.02 |
| 44576.458333333336 | 17.03 |
| 44576.46875 | 16.97 |
| 44576.479166666664 | 17 |
| 44576.489583333336 | 16.94 |
| 44576.5 | 16.86 |
| 44576.510416666664 | 16.78 |
| 44576.520833333336 | 16.76 |
| 44576.53125 | 16.74 |
| 44576.541666666664 | 16.7 |
| 44576.552083333336 | 16.71 |
| 44576.5625 | 16.72 |
| 44576.572916666664 | 16.71 |
| 44576.583333333336 | 16.69 |
| 44576.59375 | 16.69 |
| 44576.604166666664 | 16.71 |
| 44576.614583333336 | 16.7 |
| 44576.625 | 16.69 |
| 44576.635416666664 | 16.73 |
| 44576.645833333336 | 16.73 |
| 44576.65625 | 16.74 |
| 44576.666666666664 | 16.71 |
| 44576.677083333336 | 16.71 |
| 44576.6875 | 16.69 |
| 44576.697916666664 | 16.68 |
| 44576.708333333336 | 16.66 |
| 44576.71875 | 16.63 |
| 44576.729166666664 | 16.62 |
| 44576.739583333336 | 16.62 |
| 44576.75 | 16.62 |
| 44576.760416666664 | 16.61 |
| 44576.770833333336 | 16.61 |
| 44576.78125 | 16.59 |
| 44576.791666666664 | 16.59 |
| 44576.802083333336 | 16.58 |
| 44576.8125 | 16.58 |
| 44576.822916666664 | 16.57 |
| 44576.833333333336 | 16.57 |
| 44576.84375 | 16.56 |
| 44576.854166666664 | 16.53 |
| 44576.864583333336 | 16.49 |
| 44576.875 | 16.42 |
| 44576.885416666664 | 16.4 |
| 44576.895833333336 | 16.38 |
| 44576.90625 | 16.38 |
| 44576.916666666664 | 16.37 |
| 44576.927083333336 | 16.36 |
| 44576.9375 | 16.37 |
| 44576.947916666664 | 16.36 |
| 44576.958333333336 | 16.36 |
| 44576.96875 | 16.37 |
| 44576.979166666664 | 16.36 |
| 44576.989583333336 | 16.36 |
| 44577.0 | 16.35 |
| 44577.010416666664 | 16.35 |
| 44577.020833333336 | 16.33 |
| 44577.03125 | 16.33 |
| 44577.041666666664 | 16.32 |
| 44577.052083333336 | 16.33 |
| 44577.0625 | 16.32 |
| 44577.072916666664 | 16.32 |
| 44577.083333333336 | 16.33 |
| 44577.09375 | 16.33 |
| 44577.104166666664 | 16.31 |
| 44577.114583333336 | 16.32 |
| 44577.125 | 16.32 |
| 44577.135416666664 | 16.35 |
| 44577.145833333336 | 16.37 |
| 44577.15625 | 16.37 |
| 44577.166666666664 | 16.37 |
| 44577.177083333336 | 16.36 |
| 44577.1875 | 16.36 |
| 44577.197916666664 | 16.37 |
| 44577.208333333336 | 16.39 |
| 44577.21875 | 16.4 |
| 44577.229166666664 | 16.43 |
| 44577.239583333336 | 16.46 |
| 44577.25 | 16.48 |
| 44577.260416666664 | 16.51 |
| 44577.270833333336 | 16.52 |
| 44577.28125 | 16.53 |
| 44577.291666666664 | 16.53 |
| 44577.302083333336 | 16.55 |
| 44577.3125 | 16.58 |
| 44577.322916666664 | 16.59 |
| 44577.333333333336 | 16.61 |
| 44577.34375 | 16.61 |
| 44577.354166666664 | 16.61 |
| 44577.364583333336 | 16.62 |
| 44577.375 | 16.63 |
| 44577.385416666664 | 16.97 |
| 44577.395833333336 | 17.67 |
| 44577.40625 | 17.92 |
| 44577.416666666664 | 17.9 |
| 44577.427083333336 | 17.47 |
| 44577.4375 | 17.16 |
| 44577.447916666664 | 16.98 |
| 44577.458333333336 | 16.86 |
| 44577.46875 | 16.77 |
| 44577.479166666664 | 16.7 |
| 44577.489583333336 | 16.67 |
| 44577.5 | 16.65 |
| 44577.510416666664 | 16.64 |
| 44577.520833333336 | 16.65 |
| 44577.53125 | 16.67 |
| 44577.541666666664 | 16.67 |
| 44577.552083333336 | 16.67 |
| 44577.5625 | 16.68 |
| 44577.572916666664 | 16.69 |
| 44577.583333333336 | 16.71 |
| 44577.59375 | 16.74 |
| 44577.604166666664 | 16.75 |
| 44577.614583333336 | 16.76 |
| 44577.625 | 16.76 |
| 44577.635416666664 | 16.78 |
| 44577.645833333336 | 16.81 |
| 44577.65625 | 16.85 |
| 44577.666666666664 | 16.86 |
| 44577.677083333336 | 16.86 |
| 44577.6875 | 16.85 |
| 44577.697916666664 | 16.85 |
| 44577.708333333336 | 16.84 |
| 44577.71875 | 16.84 |
| 44577.729166666664 | 16.84 |
| 44577.739583333336 | 16.85 |
| 44577.75 | 16.85 |
| 44577.760416666664 | 16.86 |
| 44577.770833333336 | 16.86 |
| 44577.78125 | 16.87 |
| 44577.791666666664 | 16.88 |
| 44577.802083333336 | 16.89 |
| 44577.8125 | 16.9 |
| 44577.822916666664 | 16.9 |
| 44577.833333333336 | 16.91 |
| 44577.84375 | 16.91 |
| 44577.854166666664 | 16.93 |
| 44577.864583333336 | 16.93 |
| 44577.875 | 16.94 |
| 44577.885416666664 | 16.94 |
| 44577.895833333336 | 16.94 |
| 44577.90625 | 16.95 |
| 44577.916666666664 | 16.95 |
| 44577.927083333336 | 16.96 |
| 44577.9375 | 16.96 |
| 44577.947916666664 | 16.97 |
| 44577.958333333336 | 16.97 |
| 44577.96875 | 16.97 |
| 44577.979166666664 | 16.97 |
| 44577.989583333336 | 16.97 |
| 44578.0 | 16.98 |
| 44578.010416666664 | 17 |
| 44578.020833333336 | 17 |
| 44578.03125 | 17.01 |
| 44578.041666666664 | 17.01 |
| 44578.052083333336 | 17.01 |
| 44578.0625 | 16.98 |
| 44578.072916666664 | 16.96 |
| 44578.083333333336 | 16.97 |
| 44578.09375 | 16.98 |
| 44578.104166666664 | 16.98 |
| 44578.114583333336 | 16.98 |
| 44578.125 | 16.98 |
| 44578.135416666664 | 17.01 |
| 44578.145833333336 | 17.03 |
| 44578.15625 | 17.03 |
| 44578.166666666664 | 16.99 |
| 44578.177083333336 | 17.02 |
| 44578.1875 | 17.04 |
| 44578.197916666664 | 17.04 |
| 44578.208333333336 | 17.04 |
| 44578.21875 | 17.03 |
| 44578.229166666664 | 17.04 |
| 44578.239583333336 | 17.06 |
| 44578.25 | 17.06 |
| 44578.260416666664 | 17.1 |
| 44578.270833333336 | 17.12 |
| 44578.28125 | 17.15 |
| 44578.291666666664 | 17.16 |
| 44578.302083333336 | 17.17 |
| 44578.3125 | 17.18 |
| 44578.322916666664 | 17.18 |
| 44578.333333333336 | 17.19 |
| 44578.34375 | 17.18 |
| 44578.354166666664 | 17.19 |
| 44578.364583333336 | 17.21 |
| 44578.375 | 17.22 |
| 44578.385416666664 | 17.22 |
| 44578.395833333336 | 17.22 |
| 44578.40625 | 17.22 |
| 44578.416666666664 | 17.24 |
| 44578.427083333336 | 17.25 |
| 44578.4375 | 17.26 |
| 44578.447916666664 | 17.29 |
| 44578.458333333336 | 17.3 |
| 44578.46875 | 17.31 |
| 44578.479166666664 | 17.32 |
| 44578.489583333336 | 17.32 |
| 44578.5 | 17.34 |
| 44578.510416666664 | 17.36 |
| 44578.520833333336 | 17.39 |
| 44578.53125 | 17.4 |
| 44578.541666666664 | 17.42 |
| 44578.552083333336 | 17.44 |
| 44578.5625 | 17.45 |
| 44578.572916666664 | 17.47 |
| 44578.583333333336 | 17.49 |
| 44578.59375 | 17.5 |
| 44578.604166666664 | 17.51 |
| 44578.614583333336 | 17.53 |
| 44578.625 | 17.54 |
| 44578.635416666664 | 17.55 |
| 44578.645833333336 | 17.56 |
| 44578.65625 | 17.56 |
| 44578.666666666664 | 17.56 |
| 44578.677083333336 | 17.57 |
| 44578.6875 | 17.58 |
| 44578.697916666664 | 17.59 |
| 44578.708333333336 | 17.6 |
| 44578.71875 | 17.59 |
| 44578.729166666664 | 17.6 |
| 44578.739583333336 | 17.6 |
| 44578.75 | 17.61 |
| 44578.760416666664 | 17.62 |
| 44578.770833333336 | 17.64 |
| 44578.78125 | 17.65 |
| 44578.791666666664 | 17.65 |
| 44578.802083333336 | 17.66 |
| 44578.8125 | 17.66 |
| 44578.822916666664 | 17.68 |
| 44578.833333333336 | 17.7 |
| 44578.84375 | 17.72 |
| 44578.854166666664 | 17.74 |
| 44578.864583333336 | 17.76 |
| 44578.875 | 17.78 |
| 44578.885416666664 | 17.79 |
| 44578.895833333336 | 17.79 |
| 44578.90625 | 17.79 |
| 44578.916666666664 | 17.8 |
| 44578.927083333336 | 17.8 |
| 44578.9375 | 17.8 |
| 44578.947916666664 | 17.8 |
| 44578.958333333336 | 17.8 |
| 44578.96875 | 17.8 |
| 44578.979166666664 | 17.8 |
| 44578.989583333336 | 17.8 |
| 44579.0 | 17.8 |
| 44579.010416666664 | 17.8 |
| 44579.020833333336 | 17.81 |
| 44579.03125 | 17.81 |
| 44579.041666666664 | 17.81 |
| 44579.052083333336 | 17.81 |
| 44579.0625 | 17.81 |
| 44579.072916666664 | 17.81 |
| 44579.083333333336 | 17.81 |
| 44579.09375 | 17.82 |
| 44579.104166666664 | 17.82 |
| 44579.114583333336 | 17.82 |
| 44579.125 | 17.82 |
| 44579.135416666664 | 17.82 |
| 44579.145833333336 | 17.82 |
| 44579.15625 | 17.82 |
| 44579.166666666664 | 17.82 |
| 44579.177083333336 | 17.82 |
| 44579.1875 | 17.82 |
| 44579.197916666664 | 17.83 |
| 44579.208333333336 | 17.83 |
| 44579.21875 | 17.84 |
| 44579.229166666664 | 17.84 |
| 44579.239583333336 | 17.84 |
| 44579.25 | 17.84 |
| 44579.260416666664 | 17.84 |
| 44579.270833333336 | 17.84 |
| 44579.28125 | 17.84 |
| 44579.291666666664 | 17.85 |
| 44579.302083333336 | 17.85 |
| 44579.3125 | 17.84 |
| 44579.322916666664 | 17.85 |
| 44579.333333333336 | 17.85 |
| 44579.34375 | 17.84 |
| 44579.354166666664 | 17.84 |
| 44579.364583333336 | 17.84 |
| 44579.375 | 17.84 |
| 44579.385416666664 | 17.85 |
| 44579.395833333336 | 17.85 |
| 44579.40625 | 17.85 |
| 44579.416666666664 | 17.85 |
| 44579.427083333336 | 17.86 |
| 44579.4375 | 17.87 |
| 44579.447916666664 | 17.87 |
| 44579.458333333336 | 17.87 |
| 44579.46875 | 17.87 |
| 44579.479166666664 | 17.88 |
| 44579.489583333336 | 17.88 |
| 44579.5 | 17.88 |
| 44579.510416666664 | 17.87 |
| 44579.520833333336 | 17.87 |
| 44579.53125 | 17.87 |
| 44579.541666666664 | 17.87 |
| 44579.552083333336 | 17.87 |
| 44579.5625 | 17.86 |
| 44579.572916666664 | 17.86 |
| 44579.583333333336 | 17.86 |
| 44579.59375 | 17.86 |
| 44579.604166666664 | 17.86 |
| 44579.614583333336 | 17.86 |
| 44579.625 | 17.86 |
| 44579.635416666664 | 17.86 |
| 44579.645833333336 | 17.86 |
| 44579.65625 | 17.86 |
| 44579.666666666664 | 17.86 |
| 44579.677083333336 | 17.85 |
| 44579.6875 | 17.85 |
| 44579.697916666664 | 17.85 |
| 44579.708333333336 | 17.85 |
| 44579.71875 | 17.84 |
| 44579.729166666664 | 17.84 |
| 44579.739583333336 | 17.84 |
| 44579.75 | 17.83 |
| 44579.760416666664 | 17.83 |
| 44579.770833333336 | 17.82 |
| 44579.78125 | 17.82 |
| 44579.791666666664 | 17.81 |
| 44579.802083333336 | 17.81 |
| 44579.8125 | 17.81 |
| 44579.822916666664 | 17.81 |
| 44579.833333333336 | 17.81 |
| 44579.84375 | 17.81 |
| 44579.854166666664 | 17.81 |
| 44579.864583333336 | 17.82 |
| 44579.875 | 17.82 |
| 44579.885416666664 | 17.82 |
| 44579.895833333336 | 17.82 |
| 44579.90625 | 17.82 |
| 44579.916666666664 | 17.82 |
| 44579.927083333336 | 17.82 |
| 44579.9375 | 17.82 |
| 44579.947916666664 | 17.82 |
| 44579.958333333336 | 17.82 |
| 44579.96875 | 17.82 |
| 44579.979166666664 | 17.82 |
| 44579.989583333336 | 17.82 |
| 44580.0 | 17.81 |
| 44580.010416666664 | 17.81 |
| 44580.020833333336 | 17.81 |
| 44580.03125 | 17.81 |
| 44580.041666666664 | 17.81 |
| 44580.052083333336 | 17.82 |
| 44580.0625 | 17.82 |
| 44580.072916666664 | 17.82 |
| 44580.083333333336 | 17.82 |
| 44580.09375 | 17.82 |
| 44580.104166666664 | 17.82 |
| 44580.114583333336 | 17.82 |
| 44580.125 | 17.82 |
| 44580.135416666664 | 17.82 |
| 44580.145833333336 | 17.83 |
| 44580.15625 | 17.83 |
| 44580.166666666664 | 17.83 |
| 44580.177083333336 | 17.83 |
| 44580.1875 | 17.83 |
| 44580.197916666664 | 17.84 |
| 44580.208333333336 | 17.84 |
| 44580.21875 | 17.84 |
| 44580.229166666664 | 17.85 |
| 44580.239583333336 | 17.85 |
| 44580.25 | 17.86 |
| 44580.260416666664 | 17.86 |
| 44580.270833333336 | 17.86 |
| 44580.28125 | 17.86 |
| 44580.291666666664 | 17.86 |
| 44580.302083333336 | 17.86 |
| 44580.3125 | 17.86 |
| 44580.322916666664 | 17.86 |
| 44580.333333333336 | 17.86 |
| 44580.34375 | 17.86 |
| 44580.354166666664 | 17.86 |
| 44580.364583333336 | 17.86 |
| 44580.375 | 17.86 |
| 44580.385416666664 | 17.86 |
| 44580.395833333336 | 17.86 |
| 44580.40625 | 17.86 |
| 44580.416666666664 | 17.86 |
| 44580.427083333336 | 17.86 |
| 44580.4375 | 17.86 |
| 44580.447916666664 | 17.86 |
| 44580.458333333336 | 17.86 |
| 44580.46875 | 17.86 |
| 44580.479166666664 | 17.86 |
| 44580.489583333336 | 17.86 |
| 44580.5 | 17.86 |
| 44580.510416666664 | 17.86 |
| 44580.520833333336 | 17.86 |
| 44580.53125 | 17.86 |
| 44580.541666666664 | 17.86 |
| 44580.552083333336 | 17.86 |
| 44580.5625 | 17.85 |
| 44580.572916666664 | 17.85 |
| 44580.583333333336 | 17.85 |
| 44580.59375 | 17.85 |
| 44580.604166666664 | 17.85 |
| 44580.614583333336 | 17.85 |
| 44580.625 | 17.85 |
| 44580.635416666664 | 17.85 |
| 44580.645833333336 | 17.85 |
| 44580.65625 | 17.85 |
| 44580.666666666664 | 17.84 |
| 44580.677083333336 | 17.84 |
| 44580.6875 | 17.84 |
| 44580.697916666664 | 17.83 |
| 44580.708333333336 | 17.83 |
| 44580.71875 | 17.83 |
| 44580.729166666664 | 17.83 |
| 44580.739583333336 | 17.83 |
| 44580.75 | 17.83 |
| 44580.760416666664 | 17.82 |
| 44580.770833333336 | 17.82 |
| 44580.78125 | 17.81 |
| 44580.791666666664 | 17.81 |
| 44580.802083333336 | 17.8 |
| 44580.8125 | 17.8 |
| 44580.833333333336 | 17.77 |
| 44580.84375 | 17.79 |
| 44580.854166666664 | 17.79 |
| 44580.864583333336 | 17.79 |
| 44580.875 | 17.79 |
| 44580.885416666664 | 17.79 |
| 44580.895833333336 | 17.79 |
| 44580.90625 | 17.8 |
| 44580.916666666664 | 17.8 |
| 44580.927083333336 | 17.8 |
| 44580.9375 | 17.8 |
| 44580.947916666664 | 17.79 |
| 44580.958333333336 | 17.79 |
| 44580.96875 | 17.79 |
| 44580.979166666664 | 17.79 |
| 44580.989583333336 | 17.78 |
| 44581.0 | 17.78 |
| 44581.010416666664 | 17.78 |
| 44581.020833333336 | 17.78 |
| 44581.03125 | 17.78 |
| 44581.041666666664 | 17.78 |
| 44581.052083333336 | 17.78 |
| 44581.0625 | 17.78 |
| 44581.072916666664 | 17.78 |
| 44581.083333333336 | 17.78 |
| 44581.09375 | 17.78 |
| 44581.104166666664 | 17.78 |
| 44581.114583333336 | 17.78 |
| 44581.125 | 17.79 |
| 44581.135416666664 | 17.79 |
| 44581.145833333336 | 17.78 |
| 44581.15625 | 17.78 |
| 44581.166666666664 | 17.78 |
| 44581.177083333336 | 17.78 |
| 44581.1875 | 17.78 |
| 44581.197916666664 | 17.78 |
| 44581.208333333336 | 17.78 |
| 44581.21875 | 17.78 |
| 44581.229166666664 | 17.78 |
| 44581.239583333336 | 17.79 |
| 44581.25 | 17.79 |
| 44581.260416666664 | 17.79 |
| 44581.270833333336 | 17.79 |
| 44581.28125 | 17.79 |
| 44581.291666666664 | 17.79 |
| 44581.302083333336 | 17.79 |
| 44581.3125 | 17.79 |
| 44581.322916666664 | 17.79 |
| 44581.333333333336 | 17.79 |
| 44581.34375 | 17.79 |
| 44581.354166666664 | 17.79 |
| 44581.364583333336 | 17.79 |
| 44581.375 | 17.79 |
| 44581.385416666664 | 17.79 |
| 44581.395833333336 | 17.79 |
| 44581.40625 | 17.79 |
| 44581.416666666664 | 17.79 |
| 44581.427083333336 | 17.79 |
| 44581.4375 | 17.79 |
| 44581.447916666664 | 17.8 |
| 44581.458333333336 | 17.8 |
| 44581.46875 | 17.8 |
| 44581.479166666664 | 17.8 |
| 44581.489583333336 | 17.8 |
| 44581.5 | 17.8 |
| 44581.510416666664 | 17.8 |
| 44581.520833333336 | 17.81 |
| 44581.53125 | 17.81 |
| 44581.541666666664 | 17.81 |
| 44581.552083333336 | 17.81 |
| 44581.5625 | 17.81 |
| 44581.572916666664 | 17.81 |
| 44581.583333333336 | 17.81 |
| 44581.59375 | 17.81 |
| 44581.604166666664 | 17.81 |
| 44581.614583333336 | 17.81 |
| 44581.625 | 17.81 |
| 44581.635416666664 | 17.81 |
| 44581.645833333336 | 17.8 |
| 44581.65625 | 17.8 |
| 44581.666666666664 | 17.8 |
| 44581.677083333336 | 17.8 |
| 44581.6875 | 17.8 |
| 44581.697916666664 | 17.79 |
| 44581.708333333336 | 17.79 |
| 44581.71875 | 17.79 |
| 44581.729166666664 | 17.79 |
| 44581.739583333336 | 17.79 |
| 44581.75 | 17.78 |
| 44581.760416666664 | 17.78 |
| 44581.770833333336 | 17.78 |
| 44581.78125 | 17.78 |
| 44581.791666666664 | 17.78 |
| 44581.802083333336 | 17.78 |
| 44581.8125 | 17.78 |
| 44581.822916666664 | 17.78 |
| 44581.833333333336 | 17.78 |
| 44581.84375 | 17.78 |
| 44581.854166666664 | 17.78 |
| 44581.864583333336 | 17.78 |
| 44581.875 | 17.78 |
| 44581.885416666664 | 17.78 |
| 44581.895833333336 | 17.78 |
| 44581.90625 | 17.78 |
| 44581.916666666664 | 17.78 |
| 44581.927083333336 | 17.78 |
| 44581.9375 | 17.78 |
| 44581.947916666664 | 17.78 |
| 44581.958333333336 | 17.78 |
| 44581.96875 | 17.79 |
| 44581.979166666664 | 17.79 |
| 44581.989583333336 | 17.79 |
| 44582.0 | 17.8 |
| 44582.010416666664 | 17.8 |
| 44582.020833333336 | 17.8 |
| 44582.03125 | 17.8 |
| 44582.041666666664 | 17.81 |
| 44582.052083333336 | 17.81 |
| 44582.0625 | 17.81 |
| 44582.072916666664 | 17.81 |
| 44582.083333333336 | 17.81 |
| 44582.09375 | 17.82 |
| 44582.104166666664 | 17.82 |
| 44582.114583333336 | 17.82 |
| 44582.125 | 17.82 |
| 44582.135416666664 | 17.82 |
| 44582.145833333336 | 17.82 |
| 44582.15625 | 17.82 |
| 44582.166666666664 | 17.81 |
| 44582.177083333336 | 17.82 |
| 44582.1875 | 17.82 |
| 44582.197916666664 | 17.82 |
| 44582.208333333336 | 17.83 |
| 44582.21875 | 17.83 |
| 44582.229166666664 | 17.84 |
| 44582.239583333336 | 17.84 |
| 44582.25 | 17.84 |
| 44582.260416666664 | 17.84 |
| 44582.270833333336 | 17.84 |
| 44582.28125 | 17.85 |
| 44582.291666666664 | 17.84 |
| 44582.302083333336 | 17.85 |
| 44582.3125 | 17.85 |
| 44582.322916666664 | 17.85 |
| 44582.333333333336 | 17.85 |
| 44582.34375 | 17.85 |
| 44582.354166666664 | 17.85 |
| 44582.364583333336 | 17.85 |
| 44582.375 | 17.85 |
| 44582.385416666664 | 17.86 |
| 44582.395833333336 | 17.86 |
| 44582.40625 | 17.86 |
| 44582.416666666664 | 17.86 |
| 44582.427083333336 | 17.85 |
| 44582.4375 | 17.85 |
| 44582.447916666664 | 17.85 |
| 44582.458333333336 | 17.85 |
| 44582.46875 | 17.86 |
| 44582.479166666664 | 17.86 |
| 44582.489583333336 | 17.86 |
| 44582.5 | 17.87 |
| 44582.510416666664 | 17.87 |
| 44582.520833333336 | 17.87 |
| 44582.53125 | 17.87 |
| 44582.541666666664 | 17.88 |
| 44582.552083333336 | 17.88 |
| 44582.5625 | 17.88 |
| 44582.572916666664 | 17.88 |
| 44582.583333333336 | 17.87 |
| 44582.59375 | 17.87 |
| 44582.604166666664 | 17.87 |
| 44582.614583333336 | 17.87 |
| 44582.625 | 17.86 |
| 44582.635416666664 | 17.86 |
| 44582.645833333336 | 17.86 |
| 44582.65625 | 17.86 |
| 44582.666666666664 | 17.86 |
| 44582.677083333336 | 17.86 |
| 44582.6875 | 17.86 |
| 44582.697916666664 | 17.87 |
| 44582.708333333336 | 17.86 |
| 44582.71875 | 17.87 |
| 44582.729166666664 | 17.87 |
| 44582.739583333336 | 17.87 |
| 44582.75 | 17.87 |
| 44582.760416666664 | 17.87 |
| 44582.770833333336 | 17.88 |
| 44582.78125 | 17.88 |
| 44582.791666666664 | 17.88 |
| 44582.802083333336 | 17.89 |
| 44582.8125 | 17.89 |
| 44582.822916666664 | 17.89 |
| 44582.833333333336 | 17.89 |
| 44582.84375 | 17.89 |
| 44582.854166666664 | 17.89 |
| 44582.864583333336 | 17.89 |
| 44582.875 | 17.89 |
| 44582.885416666664 | 17.89 |
| 44582.895833333336 | 17.89 |
| 44582.90625 | 17.9 |
| 44582.916666666664 | 17.9 |
| 44582.927083333336 | 17.9 |
| 44582.9375 | 17.9 |
| 44582.947916666664 | 17.9 |
| 44582.958333333336 | 17.9 |
| 44582.96875 | 17.9 |
| 44582.979166666664 | 17.9 |
| 44582.989583333336 | 17.9 |
| 44583.0 | 17.9 |
| 44583.010416666664 | 17.89 |
| 44583.020833333336 | 17.89 |
| 44583.03125 | 17.9 |
| 44583.041666666664 | 17.9 |
| 44583.052083333336 | 17.9 |
| 44583.0625 | 17.9 |
| 44583.072916666664 | 17.9 |
| 44583.083333333336 | 17.91 |
| 44583.09375 | 17.91 |
| 44583.104166666664 | 17.91 |
| 44583.114583333336 | 17.91 |
| 44583.125 | 17.91 |
| 44583.135416666664 | 17.91 |
| 44583.145833333336 | 17.91 |
| 44583.15625 | 17.91 |
| 44583.166666666664 | 17.91 |
| 44583.177083333336 | 17.91 |
| 44583.1875 | 17.91 |
| 44583.197916666664 | 17.9 |
| 44583.208333333336 | 17.91 |
| 44583.21875 | 17.91 |
| 44583.229166666664 | 17.91 |
| 44583.239583333336 | 17.92 |
| 44583.25 | 17.92 |
| 44583.260416666664 | 17.93 |
| 44583.270833333336 | 17.93 |
| 44583.28125 | 17.94 |
| 44583.291666666664 | 17.95 |
| 44583.302083333336 | 17.95 |
| 44583.3125 | 17.96 |
| 44583.322916666664 | 17.96 |
| 44583.333333333336 | 17.96 |
| 44583.34375 | 17.97 |
| 44583.354166666664 | 17.97 |
| 44583.364583333336 | 17.98 |
| 44583.375 | 17.98 |
| 44583.385416666664 | 17.98 |
| 44583.395833333336 | 17.98 |
| 44583.40625 | 17.98 |
| 44583.416666666664 | 17.98 |
| 44583.427083333336 | 17.98 |
| 44583.4375 | 17.98 |
| 44583.447916666664 | 17.98 |
| 44583.458333333336 | 17.98 |
| 44583.46875 | 17.98 |
| 44583.479166666664 | 17.97 |
| 44583.489583333336 | 17.98 |
| 44583.5 | 17.97 |
| 44583.510416666664 | 17.97 |
| 44583.520833333336 | 17.97 |
| 44583.53125 | 17.97 |
| 44583.541666666664 | 17.97 |
| 44583.552083333336 | 17.97 |
| 44583.5625 | 17.97 |
| 44583.572916666664 | 17.97 |
| 44583.583333333336 | 17.97 |
| 44583.59375 | 17.97 |
| 44583.604166666664 | 17.97 |
| 44583.614583333336 | 17.96 |
| 44583.625 | 17.96 |
| 44583.635416666664 | 17.95 |
| 44583.645833333336 | 17.95 |
| 44583.65625 | 17.94 |
| 44583.666666666664 | 17.94 |
| 44583.677083333336 | 17.94 |
| 44583.6875 | 17.93 |
| 44583.697916666664 | 17.93 |
| 44583.708333333336 | 17.93 |
| 44583.71875 | 17.93 |
| 44583.729166666664 | 17.92 |
| 44583.739583333336 | 17.93 |
| 44583.75 | 17.93 |
| 44583.760416666664 | 17.92 |
| 44583.770833333336 | 17.92 |
| 44583.78125 | 17.92 |
| 44583.791666666664 | 17.92 |
| 44583.802083333336 | 17.92 |
| 44583.8125 | 17.92 |
| 44583.822916666664 | 17.92 |
| 44583.833333333336 | 17.92 |
| 44583.84375 | 17.91 |
| 44583.854166666664 | 17.91 |
| 44583.864583333336 | 17.91 |
| 44583.875 | 17.9 |
| 44583.885416666664 | 17.9 |
| 44583.895833333336 | 17.91 |
| 44583.90625 | 17.91 |
| 44583.916666666664 | 17.92 |
| 44583.927083333336 | 17.92 |
| 44583.9375 | 17.92 |
| 44583.947916666664 | 17.92 |
| 44583.958333333336 | 17.92 |
| 44583.96875 | 17.92 |
| 44583.979166666664 | 17.92 |
| 44583.989583333336 | 17.92 |
| 44584.0 | 17.92 |
| 44584.010416666664 | 17.92 |
| 44584.020833333336 | 17.92 |
| 44584.03125 | 17.92 |
| 44584.041666666664 | 17.92 |
| 44584.052083333336 | 17.91 |
| 44584.0625 | 17.91 |
| 44584.072916666664 | 17.91 |
| 44584.083333333336 | 17.92 |
| 44584.09375 | 17.92 |
| 44584.104166666664 | 17.92 |
| 44584.114583333336 | 17.92 |
| 44584.125 | 17.92 |
| 44584.135416666664 | 17.92 |
| 44584.145833333336 | 17.92 |
| 44584.15625 | 17.92 |
| 44584.166666666664 | 17.92 |
| 44584.177083333336 | 17.92 |
| 44584.1875 | 17.92 |
| 44584.197916666664 | 17.92 |
| 44584.208333333336 | 17.92 |
| 44584.21875 | 17.91 |
| 44584.229166666664 | 17.91 |
| 44584.239583333336 | 17.92 |
| 44584.25 | 17.93 |
| 44584.260416666664 | 17.93 |
| 44584.270833333336 | 17.93 |
| 44584.28125 | 17.93 |
| 44584.291666666664 | 17.94 |
| 44584.302083333336 | 17.94 |
| 44584.3125 | 17.95 |
| 44584.322916666664 | 17.96 |
| 44584.333333333336 | 17.97 |
| 44584.34375 | 17.97 |
| 44584.354166666664 | 17.97 |
| 44584.364583333336 | 17.97 |
| 44584.375 | 17.97 |
| 44584.385416666664 | 17.97 |
| 44584.395833333336 | 17.97 |
| 44584.40625 | 17.97 |
| 44584.416666666664 | 17.97 |
| 44584.427083333336 | 17.97 |
| 44584.4375 | 17.97 |
| 44584.447916666664 | 17.97 |
| 44584.458333333336 | 17.97 |
| 44584.46875 | 17.97 |
| 44584.479166666664 | 17.97 |
| 44584.489583333336 | 17.97 |
| 44584.5 | 17.97 |
| 44584.510416666664 | 17.97 |
| 44584.520833333336 | 17.97 |
| 44584.53125 | 17.97 |
| 44584.541666666664 | 17.96 |
| 44584.552083333336 | 17.96 |
| 44584.5625 | 17.96 |
| 44584.572916666664 | 17.95 |
| 44584.583333333336 | 17.95 |
| 44584.59375 | 17.95 |
| 44584.604166666664 | 17.95 |
| 44584.614583333336 | 17.95 |
| 44584.625 | 17.95 |
| 44584.635416666664 | 17.94 |
| 44584.645833333336 | 17.94 |
| 44584.65625 | 17.94 |
| 44584.666666666664 | 17.93 |
| 44584.677083333336 | 17.93 |
| 44584.6875 | 17.92 |
| 44584.697916666664 | 17.92 |
| 44584.708333333336 | 17.91 |
| 44584.71875 | 17.91 |
| 44584.729166666664 | 17.91 |
| 44584.739583333336 | 17.91 |
| 44584.75 | 17.91 |
| 44584.760416666664 | 17.9 |
| 44584.770833333336 | 17.89 |
| 44584.78125 | 17.89 |
| 44584.791666666664 | 17.88 |
| 44584.802083333336 | 17.88 |
| 44584.8125 | 17.88 |
| 44584.822916666664 | 17.88 |
| 44584.833333333336 | 17.87 |
| 44584.84375 | 17.87 |
| 44584.854166666664 | 17.87 |
| 44584.864583333336 | 17.87 |
| 44584.875 | 17.86 |
| 44584.885416666664 | 17.86 |
| 44584.895833333336 | 17.87 |
| 44584.90625 | 17.87 |
| 44584.916666666664 | 17.87 |
| 44584.927083333336 | 17.88 |
| 44584.9375 | 17.88 |
| 44584.947916666664 | 17.89 |
| 44584.958333333336 | 17.89 |
| 44584.96875 | 17.89 |
| 44584.979166666664 | 17.89 |
| 44584.989583333336 | 17.89 |
| 44585.0 | 17.89 |
| 44585.010416666664 | 17.89 |
| 44585.020833333336 | 17.89 |
| 44585.03125 | 17.89 |
| 44585.041666666664 | 17.89 |
| 44585.052083333336 | 17.88 |
| 44585.0625 | 17.88 |
| 44585.072916666664 | 17.88 |
| 44585.083333333336 | 17.88 |
| 44585.09375 | 17.89 |
| 44585.104166666664 | 17.89 |
| 44585.114583333336 | 17.89 |
| 44585.125 | 17.89 |
| 44585.135416666664 | 17.89 |
| 44585.145833333336 | 17.89 |
| 44585.15625 | 17.89 |
| 44585.166666666664 | 17.89 |
| 44585.177083333336 | 17.89 |
| 44585.1875 | 17.89 |
| 44585.197916666664 | 17.89 |
| 44585.208333333336 | 17.89 |
| 44585.21875 | 17.89 |
| 44585.229166666664 | 17.89 |
| 44585.239583333336 | 17.89 |
| 44585.25 | 17.89 |
| 44585.260416666664 | 17.89 |
| 44585.270833333336 | 17.89 |
| 44585.28125 | 17.89 |
| 44585.291666666664 | 17.9 |
| 44585.302083333336 | 17.9 |
| 44585.3125 | 17.9 |
| 44585.322916666664 | 17.9 |
| 44585.333333333336 | 17.91 |
| 44585.34375 | 17.91 |
| 44585.354166666664 | 17.91 |
| 44585.364583333336 | 17.92 |
| 44585.375 | 17.92 |
| 44585.385416666664 | 17.93 |
| 44585.395833333336 | 17.93 |
| 44585.40625 | 17.93 |
| 44585.416666666664 | 17.92 |
| 44585.427083333336 | 17.92 |
| 44585.4375 | 17.93 |
| 44585.447916666664 | 17.93 |
| 44585.458333333336 | 17.93 |
| 44585.46875 | 17.93 |
| 44585.479166666664 | 17.93 |
| 44585.489583333336 | 17.93 |
| 44585.5 | 17.93 |
| 44585.510416666664 | 17.93 |
| 44585.520833333336 | 17.93 |
| 44585.53125 | 17.93 |
| 44585.541666666664 | 17.93 |
| 44585.552083333336 | 17.92 |
| 44585.5625 | 17.92 |
| 44585.572916666664 | 17.92 |
| 44585.583333333336 | 17.92 |
| 44585.59375 | 17.92 |
| 44585.604166666664 | 17.92 |
| 44585.614583333336 | 17.91 |
| 44585.625 | 17.91 |
| 44585.635416666664 | 17.91 |
| 44585.645833333336 | 17.91 |
| 44585.65625 | 17.91 |
| 44585.666666666664 | 17.91 |
| 44585.677083333336 | 17.91 |
| 44585.6875 | 17.9 |
| 44585.697916666664 | 17.9 |
| 44585.708333333336 | 17.9 |
| 44585.71875 | 17.89 |
| 44585.729166666664 | 17.89 |
| 44585.739583333336 | 17.89 |
| 44585.75 | 17.88 |
| 44585.760416666664 | 17.88 |
| 44585.770833333336 | 17.88 |
| 44585.78125 | 17.87 |
| 44585.791666666664 | 17.86 |
| 44585.802083333336 | 17.86 |
| 44585.8125 | 17.86 |
| 44585.822916666664 | 17.86 |
| 44585.833333333336 | 17.85 |
| 44585.84375 | 17.85 |
| 44585.854166666664 | 17.84 |
| 44585.864583333336 | 17.82 |
| 44585.875 | 17.82 |
| 44585.885416666664 | 17.82 |
| 44585.895833333336 | 17.81 |
| 44585.90625 | 17.81 |
| 44585.916666666664 | 17.82 |
| 44585.927083333336 | 17.83 |
| 44585.9375 | 17.84 |
| 44585.947916666664 | 17.84 |
| 44585.958333333336 | 17.84 |
| 44585.96875 | 17.84 |
| 44585.979166666664 | 17.84 |
| 44585.989583333336 | 17.85 |
| 44586.0 | 17.85 |
| 44586.010416666664 | 17.85 |
| 44586.020833333336 | 17.85 |
| 44586.03125 | 17.85 |
| 44586.041666666664 | 17.85 |
| 44586.052083333336 | 17.85 |
| 44586.0625 | 17.85 |
| 44586.072916666664 | 17.85 |
| 44586.083333333336 | 17.84 |
| 44586.09375 | 17.84 |
| 44586.104166666664 | 17.84 |
| 44586.114583333336 | 17.85 |
| 44586.125 | 17.85 |
| 44586.135416666664 | 17.86 |
| 44586.145833333336 | 17.86 |
| 44586.15625 | 17.86 |
| 44586.166666666664 | 17.86 |
| 44586.177083333336 | 17.86 |
| 44586.1875 | 17.86 |
| 44586.197916666664 | 17.86 |
| 44586.208333333336 | 17.86 |
| 44586.21875 | 17.86 |
| 44586.229166666664 | 17.86 |
| 44586.239583333336 | 17.87 |
| 44586.25 | 17.87 |
| 44586.260416666664 | 17.86 |
| 44586.270833333336 | 17.86 |
| 44586.28125 | 17.86 |
| 44586.291666666664 | 17.86 |
| 44586.302083333336 | 17.86 |
| 44586.3125 | 17.86 |
| 44586.322916666664 | 17.86 |
| 44586.333333333336 | 17.87 |
| 44586.34375 | 17.87 |
| 44586.354166666664 | 17.87 |
| 44586.364583333336 | 17.87 |
| 44586.375 | 17.87 |
| 44586.385416666664 | 17.87 |
| 44586.395833333336 | 17.87 |
| 44586.40625 | 17.87 |
| 44586.416666666664 | 17.87 |
| 44586.427083333336 | 17.87 |
| 44586.4375 | 17.88 |
| 44586.447916666664 | 17.87 |
| 44586.458333333336 | 17.87 |
| 44586.46875 | 17.88 |
| 44586.479166666664 | 17.88 |
| 44586.489583333336 | 17.88 |
| 44586.5 | 17.88 |
| 44586.510416666664 | 17.87 |
| 44586.520833333336 | 17.87 |
| 44586.53125 | 17.87 |
| 44586.541666666664 | 17.87 |
| 44586.552083333336 | 17.87 |
| 44586.5625 | 17.87 |
| 44586.572916666664 | 17.87 |
| 44586.583333333336 | 17.87 |
| 44586.59375 | 17.87 |
| 44586.604166666664 | 17.87 |
| 44586.614583333336 | 17.87 |
| 44586.625 | 17.87 |
| 44586.635416666664 | 17.87 |
| 44586.645833333336 | 17.87 |
| 44586.65625 | 17.87 |
| 44586.666666666664 | 17.86 |
| 44586.677083333336 | 17.86 |
| 44586.6875 | 17.86 |
| 44586.697916666664 | 17.86 |
| 44586.708333333336 | 17.86 |
| 44586.71875 | 17.86 |
| 44586.729166666664 | 17.86 |
| 44586.739583333336 | 17.85 |
| 44586.75 | 17.85 |
| 44586.760416666664 | 17.85 |
| 44586.770833333336 | 17.85 |
| 44586.78125 | 17.85 |
| 44586.791666666664 | 17.85 |
| 44586.802083333336 | 17.85 |
| 44586.8125 | 17.85 |
| 44586.822916666664 | 17.84 |
| 44586.833333333336 | 17.84 |
| 44586.84375 | 17.83 |
| 44586.854166666664 | 17.83 |
| 44586.864583333336 | 17.83 |
| 44586.875 | 17.83 |
| 44586.885416666664 | 17.82 |
| 44586.895833333336 | 17.82 |
| 44586.90625 | 17.82 |
| 44586.916666666664 | 17.82 |
| 44586.927083333336 | 17.81 |
| 44586.9375 | 17.81 |
| 44586.947916666664 | 17.81 |
| 44586.958333333336 | 17.81 |
| 44586.96875 | 17.81 |
| 44586.979166666664 | 17.81 |
| 44586.989583333336 | 17.81 |
| 44587.0 | 17.81 |
| 44587.010416666664 | 17.81 |
| 44587.020833333336 | 17.81 |
| 44587.03125 | 17.81 |
| 44587.041666666664 | 17.81 |
| 44587.052083333336 | 17.81 |
| 44587.0625 | 17.81 |
| 44587.072916666664 | 17.81 |
| 44587.083333333336 | 17.81 |
| 44587.09375 | 17.81 |
| 44587.104166666664 | 17.82 |
| 44587.114583333336 | 17.82 |
| 44587.125 | 17.82 |
| 44587.135416666664 | 17.82 |
| 44587.145833333336 | 17.83 |
| 44587.15625 | 17.83 |
| 44587.166666666664 | 17.83 |
| 44587.177083333336 | 17.83 |
| 44587.1875 | 17.84 |
| 44587.197916666664 | 17.84 |
| 44587.208333333336 | 17.84 |
| 44587.21875 | 17.85 |
| 44587.229166666664 | 17.85 |
| 44587.239583333336 | 17.85 |
| 44587.25 | 17.85 |
| 44587.260416666664 | 17.85 |
| 44587.270833333336 | 17.85 |
| 44587.28125 | 17.85 |
| 44587.291666666664 | 17.85 |
| 44587.302083333336 | 17.85 |
| 44587.3125 | 17.85 |
| 44587.322916666664 | 17.85 |
| 44587.333333333336 | 17.85 |
| 44587.34375 | 17.85 |
| 44587.354166666664 | 17.85 |
| 44587.364583333336 | 17.85 |
| 44587.375 | 17.85 |
| 44587.385416666664 | 17.85 |
| 44587.395833333336 | 17.86 |
| 44587.40625 | 17.86 |
| 44587.416666666664 | 17.87 |
| 44587.427083333336 | 17.87 |
| 44587.4375 | 17.87 |
| 44587.447916666664 | 17.87 |
| 44587.458333333336 | 17.88 |
| 44587.46875 | 17.89 |
| 44587.479166666664 | 17.89 |
| 44587.489583333336 | 17.89 |
| 44587.5 | 17.89 |
| 44587.510416666664 | 17.89 |
| 44587.520833333336 | 17.89 |
| 44587.53125 | 17.89 |
| 44587.541666666664 | 17.89 |
| 44587.552083333336 | 17.89 |
| 44587.5625 | 17.89 |
| 44587.572916666664 | 17.89 |
| 44587.583333333336 | 17.89 |
| 44587.59375 | 17.89 |
| 44587.604166666664 | 17.89 |
| 44587.614583333336 | 17.89 |
| 44587.625 | 17.89 |
| 44587.635416666664 | 17.89 |
| 44587.645833333336 | 17.89 |
| 44587.65625 | 17.89 |
| 44587.666666666664 | 17.89 |
| 44587.677083333336 | 17.89 |
| 44587.6875 | 17.89 |
| 44587.697916666664 | 17.89 |
| 44587.708333333336 | 17.89 |
| 44587.71875 | 17.88 |
| 44587.729166666664 | 17.88 |
| 44587.739583333336 | 17.88 |
| 44587.75 | 17.88 |
| 44587.760416666664 | 17.88 |
| 44587.770833333336 | 17.88 |
| 44587.78125 | 17.88 |
| 44587.791666666664 | 17.88 |
| 44587.802083333336 | 17.87 |
| 44587.8125 | 17.87 |
| 44587.822916666664 | 17.87 |
| 44587.833333333336 | 17.87 |
| 44587.84375 | 17.87 |
| 44587.854166666664 | 17.87 |
| 44587.864583333336 | 17.87 |
| 44587.875 | 17.87 |
| 44587.885416666664 | 17.86 |
| 44587.895833333336 | 17.86 |
| 44587.90625 | 17.86 |
| 44587.916666666664 | 17.86 |
| 44587.927083333336 | 17.86 |
| 44587.9375 | 17.86 |
| 44587.947916666664 | 17.86 |
| 44587.958333333336 | 17.86 |
| 44587.96875 | 17.86 |
| 44587.979166666664 | 17.86 |
| 44587.989583333336 | 17.86 |
| 44588.0 | 17.86 |
| 44588.010416666664 | 17.87 |
| 44588.020833333336 | 17.87 |
| 44588.03125 | 17.87 |
| 44588.041666666664 | 17.87 |
| 44588.052083333336 | 17.88 |
| 44588.0625 | 17.88 |
| 44588.072916666664 | 17.88 |
| 44588.083333333336 | 17.88 |
| 44588.09375 | 17.89 |
| 44588.104166666664 | 17.89 |
| 44588.114583333336 | 17.89 |
| 44588.125 | 17.89 |
| 44588.135416666664 | 17.88 |
| 44588.145833333336 | 17.88 |
| 44588.15625 | 17.88 |
| 44588.166666666664 | 17.88 |
| 44588.177083333336 | 17.88 |
| 44588.1875 | 17.89 |
| 44588.197916666664 | 17.89 |
| 44588.208333333336 | 17.9 |
| 44588.21875 | 17.9 |
| 44588.229166666664 | 17.9 |
| 44588.239583333336 | 17.91 |
| 44588.25 | 17.91 |
| 44588.260416666664 | 17.91 |
| 44588.270833333336 | 17.91 |
| 44588.28125 | 17.91 |
| 44588.291666666664 | 17.91 |
| 44588.302083333336 | 17.91 |
| 44588.3125 | 17.91 |
| 44588.322916666664 | 17.91 |
| 44588.333333333336 | 17.9 |
| 44588.34375 | 17.9 |
| 44588.354166666664 | 17.9 |
| 44588.364583333336 | 17.9 |
| 44588.375 | 17.9 |
| 44588.385416666664 | 17.9 |
| 44588.395833333336 | 17.91 |
| 44588.40625 | 17.91 |
| 44588.416666666664 | 17.91 |
| 44588.427083333336 | 17.92 |
| 44588.4375 | 17.92 |
| 44588.447916666664 | 17.93 |
| 44588.458333333336 | 17.94 |
| 44588.46875 | 17.94 |
| 44588.479166666664 | 17.95 |
| 44588.489583333336 | 17.96 |
| 44588.5 | 17.98 |
| 44588.510416666664 | 17.98 |
| 44588.520833333336 | 17.98 |
| 44588.53125 | 17.98 |
| 44588.541666666664 | 17.98 |
| 44588.552083333336 | 17.97 |
| 44588.5625 | 17.97 |
| 44588.572916666664 | 17.97 |
| 44588.583333333336 | 17.97 |
| 44588.59375 | 17.97 |
| 44588.604166666664 | 17.96 |
| 44588.614583333336 | 17.96 |
| 44588.625 | 17.96 |
| 44588.635416666664 | 17.96 |
| 44588.645833333336 | 17.96 |
| 44588.65625 | 17.95 |
| 44588.666666666664 | 17.95 |
| 44588.677083333336 | 17.95 |
| 44588.6875 | 8.11 |
| 44588.697916666664 | 8.12 |
| 44588.708333333336 | 8.13 |
| 44588.71875 | 8.13 |
| 44588.729166666664 | 8.14 |
| 44588.739583333336 | 8.14 |
| 44588.75 | 8.15 |
| 44588.760416666664 | 8.15 |
| 44588.770833333336 | 8.16 |
| 44588.78125 | 8.16 |
| 44588.791666666664 | 8.17 |
| 44588.802083333336 | 8.17 |
| 44588.8125 | 8.17 |
| 44588.822916666664 | 8.18 |
| 44588.833333333336 | 8.18 |
| 44588.84375 | 8.18 |
| 44588.854166666664 | 8.19 |
| 44588.864583333336 | 8.19 |
| 44588.875 | 8.19 |
| 44588.885416666664 | 8.2 |
| 44588.895833333336 | 8.2 |
| 44588.90625 | 8.2 |
| 44588.916666666664 | 8.21 |
| 44588.927083333336 | 8.2 |
| 44588.9375 | 8.21 |
| 44588.947916666664 | 8.2 |
| 44588.958333333336 | 8.2 |
| 44588.96875 | 8.2 |
| 44588.979166666664 | 8.2 |
| 44588.989583333336 | 8.21 |
| 44589.0 | 8.21 |
| 44589.010416666664 | 8.21 |
| 44589.020833333336 | 8.22 |
| 44589.03125 | 8.21 |
| 44589.041666666664 | 8.22 |
| 44589.052083333336 | 8.22 |
| 44589.0625 | 8.22 |
| 44589.072916666664 | 8.22 |
| 44589.083333333336 | 8.21 |
| 44589.09375 | 8.22 |
| 44589.104166666664 | 8.22 |
| 44589.114583333336 | 8.22 |
| 44589.125 | 8.22 |
| 44589.135416666664 | 8.22 |
| 44589.145833333336 | 8.22 |
| 44589.15625 | 8.22 |
| 44589.166666666664 | 8.22 |
| 44589.177083333336 | 8.22 |
| 44589.1875 | 8.22 |
| 44589.197916666664 | 8.22 |
| 44589.208333333336 | 8.21 |
| 44589.21875 | 8.21 |
| 44589.229166666664 | 8.21 |
| 44589.239583333336 | 8.21 |
| 44589.25 | 8.21 |
| 44589.260416666664 | 8.21 |
| 44589.270833333336 | 8.21 |
| 44589.28125 | 8.21 |
| 44589.291666666664 | 8.21 |
| 44589.302083333336 | 8.2 |
| 44589.3125 | 8.2 |
| 44589.322916666664 | 8.2 |
| 44589.333333333336 | 8.2 |
| 44589.34375 | 8.2 |
| 44589.354166666664 | 8.2 |
| 44589.364583333336 | 8.2 |
| 44589.375 | 8.2 |
| 44589.385416666664 | 8.2 |
| 44589.395833333336 | 8.2 |
| 44589.40625 | 8.2 |
| 44589.416666666664 | 8.2 |
| 44589.427083333336 | 8.2 |
| 44589.4375 | 8.2 |
| 44589.447916666664 | 8.2 |
| 44589.458333333336 | 8.2 |
| 44589.46875 | 8.19 |
| 44589.479166666664 | 8.19 |
| 44589.489583333336 | 8.19 |
| 44589.5 | 8.19 |
| 44589.510416666664 | 8.19 |
| 44589.520833333336 | 8.18 |
| 44589.53125 | 8.18 |
| 44589.541666666664 | 8.17 |
| 44589.552083333336 | 8.16 |
| 44589.5625 | 8.17 |
| 44589.572916666664 | 8.18 |
| 44589.583333333336 | 8.19 |
| 44589.59375 | 8.18 |
| 44589.604166666664 | 8.18 |
| 44589.614583333336 | 8.18 |
| 44589.625 | 8.18 |
| 44589.635416666664 | 8.18 |
| 44589.645833333336 | 8.18 |
| 44589.65625 | 8.18 |
| 44589.666666666664 | 8.19 |
| 44589.677083333336 | 8.19 |
| 44589.6875 | 8.2 |
| 44589.697916666664 | 8.2 |
| 44589.708333333336 | 8.2 |
| 44589.71875 | 8.21 |
| 44589.729166666664 | 8.21 |
| 44589.739583333336 | 8.21 |
| 44589.75 | 8.21 |
| 44589.760416666664 | 8.21 |
| 44589.770833333336 | 8.21 |
| 44589.78125 | 8.21 |
| 44589.791666666664 | 8.21 |
| 44589.802083333336 | 8.21 |
| 44589.8125 | 8.22 |
| 44589.822916666664 | 8.22 |
| 44589.833333333336 | 8.22 |
| 44589.84375 | 8.22 |
| 44589.854166666664 | 8.22 |
| 44589.864583333336 | 8.22 |
| 44589.875 | 8.23 |
| 44589.885416666664 | 8.23 |
| 44589.895833333336 | 8.23 |
| 44589.90625 | 8.23 |
| 44589.916666666664 | 8.23 |
| 44589.927083333336 | 8.23 |
| 44589.9375 | 8.23 |
| 44589.947916666664 | 8.23 |
| 44589.958333333336 | 8.23 |
| 44589.96875 | 8.23 |
| 44589.979166666664 | 8.23 |
| 44589.989583333336 | 8.23 |
| 44590.0 | 8.23 |
| 44590.010416666664 | 8.22 |
| 44590.020833333336 | 8.22 |
| 44590.03125 | 8.22 |
| 44590.041666666664 | 8.21 |
| 44590.052083333336 | 8.22 |
| 44590.0625 | 8.21 |
| 44590.072916666664 | 8.21 |
| 44590.083333333336 | 8.21 |
| 44590.09375 | 8.21 |
| 44590.104166666664 | 8.21 |
| 44590.114583333336 | 8.21 |
| 44590.125 | 8.21 |
| 44590.135416666664 | 8.21 |
| 44590.145833333336 | 8.21 |
| 44590.15625 | 8.21 |
| 44590.166666666664 | 8.22 |
| 44590.177083333336 | 8.22 |
| 44590.1875 | 8.21 |
| 44590.197916666664 | 8.21 |
| 44590.208333333336 | 8.21 |
| 44590.21875 | 8.21 |
| 44590.229166666664 | 8.21 |
| 44590.239583333336 | 8.21 |
| 44590.25 | 8.21 |
| 44590.260416666664 | 8.21 |
| 44590.270833333336 | 8.2 |
| 44590.28125 | 8.2 |
| 44590.291666666664 | 8.2 |
| 44590.302083333336 | 8.2 |
| 44590.3125 | 8.2 |
| 44590.322916666664 | 8.2 |
| 44590.333333333336 | 8.2 |
| 44590.34375 | 8.2 |
| 44590.354166666664 | 8.19 |
| 44590.364583333336 | 8.19 |
| 44590.375 | 8.19 |
| 44590.385416666664 | 8.19 |
| 44590.395833333336 | 8.19 |
| 44590.40625 | 8.19 |
| 44590.416666666664 | 8.18 |
| 44590.427083333336 | 8.18 |
| 44590.4375 | 8.18 |
| 44590.447916666664 | 8.18 |
| 44590.458333333336 | 8.18 |
| 44590.46875 | 8.18 |
| 44590.479166666664 | 8.18 |
| 44590.489583333336 | 8.18 |
| 44590.5 | 8.18 |
| 44590.510416666664 | 8.18 |
| 44590.520833333336 | 8.18 |
| 44590.53125 | 8.17 |
| 44590.541666666664 | 8.17 |
| 44590.552083333336 | 8.17 |
| 44590.5625 | 8.17 |
| 44590.572916666664 | 8.17 |
| 44590.583333333336 | 8.17 |
| 44590.59375 | 8.17 |
| 44590.604166666664 | 8.17 |
| 44590.614583333336 | 8.17 |
| 44590.625 | 8.16 |
| 44590.635416666664 | 8.16 |
| 44590.645833333336 | 8.16 |
| 44590.65625 | 8.17 |
| 44590.666666666664 | 8.16 |
| 44590.677083333336 | 8.16 |
| 44590.6875 | 8.16 |
| 44590.697916666664 | 8.16 |
| 44590.708333333336 | 8.16 |
| 44590.71875 | 8.16 |
| 44590.729166666664 | 8.16 |
| 44590.739583333336 | 8.16 |
| 44590.75 | 8.16 |
| 44590.760416666664 | 8.16 |
| 44590.770833333336 | 8.16 |
| 44590.78125 | 8.17 |
| 44590.791666666664 | 8.17 |
| 44590.802083333336 | 8.17 |
| 44590.8125 | 8.16 |
| 44590.822916666664 | 8.16 |
| 44590.833333333336 | 8.16 |
| 44590.84375 | 8.17 |
| 44590.854166666664 | 8.16 |
| 44590.864583333336 | 8.16 |
| 44590.875 | 8.16 |
| 44590.885416666664 | 8.16 |
| 44590.895833333336 | 8.16 |
| 44590.90625 | 8.16 |
| 44590.916666666664 | 8.16 |
| 44590.927083333336 | 8.16 |
| 44590.9375 | 8.16 |
| 44590.947916666664 | 8.16 |
| 44590.958333333336 | 8.16 |
| 44590.96875 | 8.16 |
| 44590.979166666664 | 8.16 |
| 44590.989583333336 | 8.16 |
| 44591.0 | 8.16 |
| 44591.010416666664 | 8.16 |
| 44591.020833333336 | 8.16 |
| 44591.03125 | 8.16 |
| 44591.041666666664 | 8.16 |
| 44591.052083333336 | 8.15 |
| 44591.0625 | 8.15 |
| 44591.072916666664 | 8.15 |
| 44591.083333333336 | 8.15 |
| 44591.09375 | 8.15 |
| 44591.104166666664 | 8.14 |
| 44591.114583333336 | 8.14 |
| 44591.125 | 8.14 |
| 44591.135416666664 | 8.14 |
| 44591.145833333336 | 8.13 |
| 44591.15625 | 8.13 |
| 44591.166666666664 | 8.13 |
| 44591.177083333336 | 8.12 |
| 44591.1875 | 8.12 |
| 44591.197916666664 | 8.12 |
| 44591.208333333336 | 8.11 |
| 44591.21875 | 8.11 |
| 44591.229166666664 | 8.11 |
| 44591.239583333336 | 8.11 |
| 44591.25 | 8.11 |
| 44591.260416666664 | 8.11 |
| 44591.270833333336 | 8.11 |
| 44591.28125 | 8.12 |
| 44591.291666666664 | 8.12 |
| 44591.302083333336 | 8.12 |
| 44591.3125 | 8.12 |
| 44591.322916666664 | 8.12 |
| 44591.333333333336 | 8.12 |
| 44591.34375 | 8.12 |
| 44591.354166666664 | 8.12 |
| 44591.364583333336 | 8.12 |
| 44591.375 | 8.12 |
| 44591.385416666664 | 8.12 |
| 44591.395833333336 | 8.12 |
| 44591.40625 | 8.13 |
| 44591.416666666664 | 8.13 |
| 44591.427083333336 | 8.12 |
| 44591.4375 | 8.12 |
| 44591.447916666664 | 8.12 |
| 44591.458333333336 | 8.12 |
| 44591.46875 | 8.12 |
| 44591.479166666664 | 8.12 |
| 44591.489583333336 | 8.12 |
| 44591.5 | 8.12 |
| 44591.510416666664 | 8.12 |
| 44591.520833333336 | 8.12 |
| 44591.53125 | 8.12 |
| 44591.541666666664 | 8.12 |
| 44591.552083333336 | 8.12 |
| 44591.5625 | 8.12 |
| 44591.572916666664 | 8.12 |
| 44591.583333333336 | 8.12 |
| 44591.59375 | 8.12 |
| 44591.604166666664 | 8.12 |
| 44591.614583333336 | 8.12 |
| 44591.625 | 8.11 |
| 44591.635416666664 | 8.11 |
| 44591.645833333336 | 8.11 |
| 44591.65625 | 8.1 |
| 44591.666666666664 | 8.1 |
| 44591.677083333336 | 8.1 |
| 44591.6875 | 8.1 |
| 44591.697916666664 | 8.1 |
| 44591.708333333336 | 8.1 |
| 44591.71875 | 8.1 |
| 44591.729166666664 | 8.09 |
| 44591.739583333336 | 8.09 |
| 44591.75 | 8.09 |
| 44591.760416666664 | 8.09 |
| 44591.770833333336 | 8.09 |
| 44591.78125 | 8.09 |
| 44591.791666666664 | 8.09 |
| 44591.802083333336 | 8.09 |
| 44591.8125 | 8.1 |
| 44591.822916666664 | 8.1 |
| 44591.833333333336 | 8.1 |
| 44591.84375 | 8.11 |
| 44591.854166666664 | 8.11 |
| 44591.864583333336 | 8.12 |
| 44591.875 | 8.12 |
| 44591.885416666664 | 8.12 |
| 44591.895833333336 | 8.13 |
| 44591.90625 | 8.13 |
| 44591.916666666664 | 8.13 |
| 44591.927083333336 | 8.13 |
| 44591.9375 | 8.13 |
| 44591.947916666664 | 8.13 |
| 44591.958333333336 | 8.13 |
| 44591.96875 | 8.14 |
| 44591.979166666664 | 8.14 |
| 44591.989583333336 | 8.14 |
| 44592.0 | 8.14 |
| 44592.010416666664 | 8.14 |
| 44592.020833333336 | 8.14 |
| 44592.03125 | 8.14 |
| 44592.041666666664 | 8.13 |
| 44592.052083333336 | 8.14 |
| 44592.0625 | 8.13 |
| 44592.072916666664 | 8.13 |
| 44592.083333333336 | 8.13 |
| 44592.09375 | 8.12 |
| 44592.104166666664 | 8.12 |
| 44592.114583333336 | 8.12 |
| 44592.125 | 8.11 |
| 44592.135416666664 | 8.1 |
| 44592.145833333336 | 8.09 |
| 44592.15625 | 8.09 |
| 44592.166666666664 | 8.08 |
| 44592.177083333336 | 8.07 |
| 44592.1875 | 8.07 |
| 44592.197916666664 | 8.07 |
| 44592.208333333336 | 8.06 |
| 44592.21875 | 8.06 |
| 44592.229166666664 | 8.05 |
| 44592.239583333336 | 8.05 |
| 44592.25 | 8.05 |
| 44592.260416666664 | 8.06 |
| 44592.270833333336 | 8.05 |
| 44592.28125 | 8.05 |
| 44592.291666666664 | 8.06 |
| 44592.302083333336 | 8.06 |
| 44592.3125 | 8.06 |
| 44592.322916666664 | 8.06 |
| 44592.333333333336 | 8.07 |
| 44592.34375 | 8.07 |
| 44592.354166666664 | 8.08 |
| 44592.364583333336 | 8.08 |
| 44592.375 | 8.09 |
| 44592.385416666664 | 8.09 |
| 44592.395833333336 | 8.09 |
| 44592.40625 | 8.1 |
| 44592.416666666664 | 8.1 |
| 44592.427083333336 | 8.11 |
| 44592.4375 | 8.11 |
| 44592.447916666664 | 8.11 |
| 44592.458333333336 | 8.12 |
| 44592.46875 | 8.12 |
| 44592.479166666664 | 8.12 |
| 44592.489583333336 | 8.11 |
| 44592.5 | 8.11 |
| 44592.510416666664 | 8.11 |
| 44592.520833333336 | 8.11 |
| 44592.53125 | 8.11 |
| 44592.541666666664 | 8.11 |
| 44592.552083333336 | 8.11 |
| 44592.5625 | 8.11 |
| 44592.572916666664 | 8.11 |
| 44592.583333333336 | 8.11 |
| 44592.59375 | 8.11 |
| 44592.604166666664 | 8.11 |
| 44592.614583333336 | 8.11 |
| 44592.625 | 8.11 |
| 44592.635416666664 | 8.1 |
| 44592.645833333336 | 8.1 |
| 44592.65625 | 8.09 |
| 44592.666666666664 | 8.09 |
| 44592.677083333336 | 8.09 |
| 44592.6875 | 8.09 |
| 44592.697916666664 | 8.09 |
| 44592.708333333336 | 8.09 |
| 44592.71875 | 8.08 |
| 44592.729166666664 | 8.08 |
| 44592.739583333336 | 8.08 |
| 44592.75 | 8.08 |
| 44592.760416666664 | 8.08 |
| 44592.770833333336 | 8.08 |
| 44592.78125 | 8.08 |
| 44592.791666666664 | 8.08 |
| 44592.802083333336 | 8.09 |
| 44592.8125 | 8.08 |
| 44592.822916666664 | 8.08 |
| 44592.833333333336 | 8.08 |
| 44592.84375 | 8.08 |
| 44592.854166666664 | 8.08 |
| 44592.864583333336 | 8.08 |
| 44592.875 | 8.08 |
| 44592.885416666664 | 8.09 |
| 44592.895833333336 | 8.1 |
| 44592.90625 | 8.1 |
| 44592.916666666664 | 8.1 |
| 44592.927083333336 | 8.1 |
| 44592.9375 | 8.1 |
| 44592.947916666664 | 8.1 |
| 44592.958333333336 | 8.11 |
| 44592.96875 | 8.11 |
| 44592.979166666664 | 8.11 |
| 44592.989583333336 | 8.11 |
| 44593.0 | 8.11 |
| 44593.010416666664 | 8.12 |
| 44593.020833333336 | 8.12 |
| 44593.03125 | 8.12 |
| 44593.041666666664 | 8.12 |
| 44593.052083333336 | 8.12 |
| 44593.0625 | 8.12 |
| 44593.072916666664 | 8.12 |
| 44593.083333333336 | 8.12 |
| 44593.09375 | 8.11 |
| 44593.104166666664 | 8.11 |
| 44593.114583333336 | 8.11 |
| 44593.125 | 8.11 |
| 44593.135416666664 | 8.1 |
| 44593.145833333336 | 8.09 |
| 44593.15625 | 8.08 |